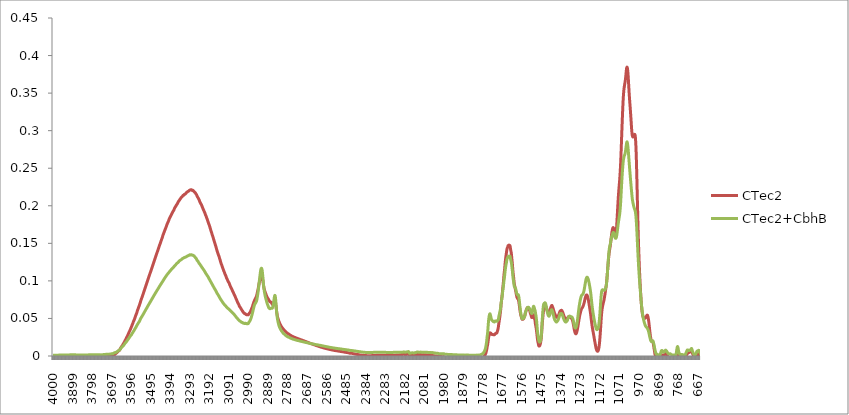
| Category | CTec2 | CTec2+CbhB |
|---|---|---|
| 4000.0 | -0.002 | 0.001 |
| 3999.0 | -0.002 | 0.001 |
| 3998.0 | -0.002 | 0.001 |
| 3997.0 | -0.002 | 0.001 |
| 3996.0 | -0.002 | 0.001 |
| 3995.0 | -0.002 | 0.001 |
| 3994.0 | -0.002 | 0.001 |
| 3993.0 | -0.002 | 0.001 |
| 3992.0 | -0.002 | 0.001 |
| 3991.0 | -0.002 | 0.001 |
| 3990.0 | -0.002 | 0.001 |
| 3989.0 | -0.002 | 0.001 |
| 3988.0 | -0.002 | 0.001 |
| 3987.0 | -0.002 | 0.001 |
| 3986.0 | -0.002 | 0.001 |
| 3985.0 | -0.002 | 0.001 |
| 3984.0 | -0.002 | 0.001 |
| 3983.0 | -0.002 | 0.001 |
| 3982.0 | -0.002 | 0.001 |
| 3981.0 | -0.002 | 0.001 |
| 3980.0 | -0.002 | 0.001 |
| 3979.0 | -0.002 | 0.001 |
| 3978.0 | -0.002 | 0.001 |
| 3977.0 | -0.002 | 0.001 |
| 3976.0 | -0.002 | 0.001 |
| 3975.0 | -0.002 | 0.001 |
| 3974.0 | -0.002 | 0.001 |
| 3973.0 | -0.002 | 0.001 |
| 3972.0 | -0.002 | 0.001 |
| 3971.0 | -0.002 | 0.001 |
| 3970.0 | -0.002 | 0.001 |
| 3969.0 | -0.002 | 0.001 |
| 3968.0 | -0.002 | 0.001 |
| 3967.0 | -0.002 | 0.001 |
| 3966.0 | -0.002 | 0.001 |
| 3965.0 | -0.002 | 0.001 |
| 3964.0 | -0.002 | 0.001 |
| 3963.0 | -0.002 | 0.001 |
| 3962.0 | -0.002 | 0.001 |
| 3961.0 | -0.002 | 0.001 |
| 3960.0 | -0.002 | 0.001 |
| 3959.0 | -0.002 | 0.001 |
| 3958.0 | -0.002 | 0.001 |
| 3957.0 | -0.002 | 0.001 |
| 3956.0 | -0.002 | 0.001 |
| 3955.0 | -0.002 | 0.001 |
| 3954.0 | -0.002 | 0.001 |
| 3953.0 | -0.002 | 0.001 |
| 3952.0 | -0.002 | 0.001 |
| 3951.0 | -0.002 | 0.001 |
| 3950.0 | -0.002 | 0.001 |
| 3949.0 | -0.002 | 0.001 |
| 3948.0 | -0.002 | 0.001 |
| 3947.0 | -0.002 | 0.001 |
| 3946.0 | -0.002 | 0.001 |
| 3945.0 | -0.002 | 0.001 |
| 3944.0 | -0.002 | 0.001 |
| 3943.0 | -0.002 | 0.001 |
| 3942.0 | -0.002 | 0.001 |
| 3941.0 | -0.002 | 0.001 |
| 3940.0 | -0.002 | 0.001 |
| 3939.0 | -0.002 | 0.001 |
| 3938.0 | -0.002 | 0.001 |
| 3937.0 | -0.002 | 0.001 |
| 3936.0 | -0.002 | 0.001 |
| 3935.0 | -0.002 | 0.001 |
| 3934.0 | -0.002 | 0.001 |
| 3933.0 | -0.002 | 0.001 |
| 3932.0 | -0.002 | 0.001 |
| 3931.0 | -0.002 | 0.001 |
| 3930.0 | -0.002 | 0.001 |
| 3929.0 | -0.002 | 0.001 |
| 3928.0 | -0.002 | 0.001 |
| 3927.0 | -0.002 | 0.001 |
| 3926.0 | -0.002 | 0.001 |
| 3925.0 | -0.002 | 0.001 |
| 3924.0 | -0.002 | 0.001 |
| 3923.0 | -0.002 | 0.001 |
| 3922.0 | -0.002 | 0.001 |
| 3921.0 | -0.002 | 0.001 |
| 3920.0 | -0.002 | 0.001 |
| 3919.0 | -0.002 | 0.001 |
| 3918.0 | -0.002 | 0.001 |
| 3917.0 | -0.002 | 0.001 |
| 3916.0 | -0.002 | 0.001 |
| 3915.0 | -0.002 | 0.002 |
| 3914.0 | -0.002 | 0.002 |
| 3913.0 | -0.002 | 0.002 |
| 3912.0 | -0.002 | 0.002 |
| 3911.0 | -0.002 | 0.002 |
| 3910.0 | -0.002 | 0.002 |
| 3909.0 | -0.002 | 0.002 |
| 3908.0 | -0.002 | 0.002 |
| 3907.0 | -0.002 | 0.002 |
| 3906.0 | -0.002 | 0.002 |
| 3905.0 | -0.002 | 0.002 |
| 3904.0 | -0.002 | 0.002 |
| 3903.0 | -0.002 | 0.002 |
| 3902.0 | -0.002 | 0.002 |
| 3901.0 | -0.002 | 0.002 |
| 3900.0 | -0.002 | 0.002 |
| 3899.0 | -0.002 | 0.002 |
| 3898.0 | -0.002 | 0.002 |
| 3897.0 | -0.002 | 0.002 |
| 3896.0 | -0.002 | 0.002 |
| 3895.0 | -0.002 | 0.002 |
| 3894.0 | -0.002 | 0.002 |
| 3893.0 | -0.002 | 0.002 |
| 3892.0 | -0.002 | 0.002 |
| 3891.0 | -0.002 | 0.002 |
| 3890.0 | -0.002 | 0.002 |
| 3889.0 | -0.002 | 0.002 |
| 3888.0 | -0.002 | 0.002 |
| 3887.0 | -0.002 | 0.002 |
| 3886.0 | -0.002 | 0.002 |
| 3885.0 | -0.002 | 0.002 |
| 3884.0 | -0.002 | 0.002 |
| 3883.0 | -0.002 | 0.002 |
| 3882.0 | -0.002 | 0.001 |
| 3881.0 | -0.002 | 0.001 |
| 3880.0 | -0.002 | 0.001 |
| 3879.0 | -0.002 | 0.001 |
| 3878.0 | -0.002 | 0.001 |
| 3877.0 | -0.002 | 0.001 |
| 3876.0 | -0.002 | 0.001 |
| 3875.0 | -0.002 | 0.001 |
| 3874.0 | -0.002 | 0.001 |
| 3873.0 | -0.002 | 0.001 |
| 3872.0 | -0.002 | 0.001 |
| 3871.0 | -0.002 | 0.001 |
| 3870.0 | -0.002 | 0.001 |
| 3869.0 | -0.002 | 0.001 |
| 3868.0 | -0.002 | 0.001 |
| 3867.0 | -0.002 | 0.001 |
| 3866.0 | -0.002 | 0.001 |
| 3865.0 | -0.002 | 0.001 |
| 3864.0 | -0.002 | 0.001 |
| 3863.0 | -0.002 | 0.001 |
| 3862.0 | -0.002 | 0.001 |
| 3861.0 | -0.002 | 0.001 |
| 3860.0 | -0.002 | 0.001 |
| 3859.0 | -0.002 | 0.001 |
| 3858.0 | -0.002 | 0.001 |
| 3857.0 | -0.002 | 0.001 |
| 3856.0 | -0.002 | 0.001 |
| 3855.0 | -0.002 | 0.001 |
| 3854.0 | -0.002 | 0.001 |
| 3853.0 | -0.002 | 0.001 |
| 3852.0 | -0.002 | 0.001 |
| 3851.0 | -0.002 | 0.001 |
| 3850.0 | -0.002 | 0.001 |
| 3849.0 | -0.002 | 0.001 |
| 3848.0 | -0.002 | 0.001 |
| 3847.0 | -0.002 | 0.001 |
| 3846.0 | -0.002 | 0.001 |
| 3845.0 | -0.002 | 0.001 |
| 3844.0 | -0.002 | 0.001 |
| 3843.0 | -0.002 | 0.001 |
| 3842.0 | -0.002 | 0.001 |
| 3841.0 | -0.002 | 0.001 |
| 3840.0 | -0.002 | 0.001 |
| 3839.0 | -0.002 | 0.001 |
| 3838.0 | -0.002 | 0.001 |
| 3837.0 | -0.002 | 0.001 |
| 3836.0 | -0.002 | 0.001 |
| 3835.0 | -0.002 | 0.001 |
| 3834.0 | -0.002 | 0.001 |
| 3833.0 | -0.002 | 0.001 |
| 3832.0 | -0.002 | 0.001 |
| 3831.0 | -0.002 | 0.001 |
| 3830.0 | -0.002 | 0.001 |
| 3829.0 | -0.002 | 0.001 |
| 3828.0 | -0.002 | 0.001 |
| 3827.0 | -0.002 | 0.001 |
| 3826.0 | -0.002 | 0.001 |
| 3825.0 | -0.002 | 0.001 |
| 3824.0 | -0.002 | 0.001 |
| 3823.0 | -0.002 | 0.001 |
| 3822.0 | -0.002 | 0.001 |
| 3821.0 | -0.002 | 0.001 |
| 3820.0 | -0.002 | 0.001 |
| 3819.0 | -0.002 | 0.001 |
| 3818.0 | -0.002 | 0.001 |
| 3817.0 | -0.002 | 0.002 |
| 3816.0 | -0.002 | 0.002 |
| 3815.0 | -0.002 | 0.002 |
| 3814.0 | -0.002 | 0.002 |
| 3813.0 | -0.002 | 0.002 |
| 3812.0 | -0.002 | 0.002 |
| 3811.0 | -0.002 | 0.002 |
| 3810.0 | -0.002 | 0.002 |
| 3809.0 | -0.002 | 0.002 |
| 3808.0 | -0.002 | 0.002 |
| 3807.0 | -0.002 | 0.002 |
| 3806.0 | -0.002 | 0.002 |
| 3805.0 | -0.002 | 0.002 |
| 3804.0 | -0.002 | 0.002 |
| 3803.0 | -0.002 | 0.002 |
| 3802.0 | -0.002 | 0.002 |
| 3801.0 | -0.002 | 0.002 |
| 3800.0 | -0.002 | 0.002 |
| 3799.0 | -0.002 | 0.002 |
| 3798.0 | -0.002 | 0.002 |
| 3797.0 | -0.002 | 0.002 |
| 3796.0 | -0.002 | 0.002 |
| 3795.0 | -0.002 | 0.002 |
| 3794.0 | -0.002 | 0.002 |
| 3793.0 | -0.002 | 0.002 |
| 3792.0 | -0.002 | 0.002 |
| 3791.0 | -0.002 | 0.002 |
| 3790.0 | -0.002 | 0.002 |
| 3789.0 | -0.002 | 0.002 |
| 3788.0 | -0.002 | 0.002 |
| 3787.0 | -0.002 | 0.002 |
| 3786.0 | -0.002 | 0.002 |
| 3785.0 | -0.002 | 0.002 |
| 3784.0 | -0.002 | 0.002 |
| 3783.0 | -0.002 | 0.002 |
| 3782.0 | -0.002 | 0.002 |
| 3781.0 | -0.002 | 0.002 |
| 3780.0 | -0.002 | 0.002 |
| 3779.0 | -0.002 | 0.002 |
| 3778.0 | -0.002 | 0.002 |
| 3777.0 | -0.002 | 0.002 |
| 3776.0 | -0.002 | 0.002 |
| 3775.0 | -0.002 | 0.002 |
| 3774.0 | -0.002 | 0.002 |
| 3773.0 | -0.002 | 0.002 |
| 3772.0 | -0.002 | 0.002 |
| 3771.0 | -0.002 | 0.002 |
| 3770.0 | -0.002 | 0.002 |
| 3769.0 | -0.002 | 0.002 |
| 3768.0 | -0.002 | 0.002 |
| 3767.0 | -0.002 | 0.002 |
| 3766.0 | -0.002 | 0.002 |
| 3765.0 | -0.002 | 0.002 |
| 3764.0 | -0.002 | 0.002 |
| 3763.0 | -0.002 | 0.002 |
| 3762.0 | -0.002 | 0.002 |
| 3761.0 | -0.002 | 0.002 |
| 3760.0 | -0.002 | 0.002 |
| 3759.0 | -0.002 | 0.002 |
| 3758.0 | -0.002 | 0.002 |
| 3757.0 | -0.002 | 0.002 |
| 3756.0 | -0.002 | 0.002 |
| 3755.0 | -0.002 | 0.002 |
| 3754.0 | -0.002 | 0.002 |
| 3753.0 | -0.002 | 0.001 |
| 3752.0 | -0.002 | 0.001 |
| 3751.0 | -0.002 | 0.001 |
| 3750.0 | -0.002 | 0.001 |
| 3749.0 | -0.002 | 0.002 |
| 3748.0 | -0.002 | 0.002 |
| 3747.0 | -0.002 | 0.002 |
| 3746.0 | -0.002 | 0.002 |
| 3745.0 | -0.002 | 0.002 |
| 3744.0 | -0.001 | 0.002 |
| 3743.0 | -0.001 | 0.002 |
| 3742.0 | -0.001 | 0.002 |
| 3741.0 | -0.001 | 0.002 |
| 3740.0 | -0.001 | 0.002 |
| 3739.0 | -0.001 | 0.002 |
| 3738.0 | -0.001 | 0.002 |
| 3737.0 | -0.001 | 0.002 |
| 3736.0 | -0.001 | 0.002 |
| 3735.0 | -0.001 | 0.002 |
| 3734.0 | -0.001 | 0.002 |
| 3733.0 | -0.001 | 0.002 |
| 3732.0 | -0.001 | 0.002 |
| 3731.0 | -0.001 | 0.002 |
| 3730.0 | -0.001 | 0.002 |
| 3729.0 | -0.001 | 0.002 |
| 3728.0 | -0.001 | 0.002 |
| 3727.0 | -0.001 | 0.002 |
| 3726.0 | -0.001 | 0.002 |
| 3725.0 | -0.001 | 0.002 |
| 3724.0 | -0.001 | 0.002 |
| 3723.0 | -0.001 | 0.002 |
| 3722.0 | -0.001 | 0.002 |
| 3721.0 | -0.001 | 0.002 |
| 3720.0 | -0.001 | 0.002 |
| 3719.0 | -0.001 | 0.002 |
| 3718.0 | -0.001 | 0.002 |
| 3717.0 | -0.001 | 0.002 |
| 3716.0 | -0.001 | 0.002 |
| 3715.0 | -0.001 | 0.002 |
| 3714.0 | -0.001 | 0.002 |
| 3713.0 | -0.001 | 0.002 |
| 3712.0 | -0.001 | 0.002 |
| 3711.0 | -0.001 | 0.002 |
| 3710.0 | -0.001 | 0.002 |
| 3709.0 | -0.001 | 0.002 |
| 3708.0 | -0.001 | 0.002 |
| 3707.0 | 0 | 0.003 |
| 3706.0 | 0 | 0.003 |
| 3705.0 | 0 | 0.003 |
| 3704.0 | 0 | 0.003 |
| 3703.0 | 0 | 0.003 |
| 3702.0 | 0 | 0.003 |
| 3701.0 | 0 | 0.003 |
| 3700.0 | 0 | 0.003 |
| 3699.0 | 0 | 0.003 |
| 3698.0 | 0 | 0.003 |
| 3697.0 | 0 | 0.003 |
| 3696.0 | 0 | 0.003 |
| 3695.0 | 0 | 0.003 |
| 3694.0 | 0 | 0.003 |
| 3693.0 | 0.001 | 0.003 |
| 3692.0 | 0.001 | 0.003 |
| 3691.0 | 0.001 | 0.003 |
| 3690.0 | 0.001 | 0.003 |
| 3689.0 | 0.001 | 0.003 |
| 3688.0 | 0.001 | 0.003 |
| 3687.0 | 0.001 | 0.004 |
| 3686.0 | 0.002 | 0.004 |
| 3685.0 | 0.002 | 0.004 |
| 3684.0 | 0.002 | 0.004 |
| 3683.0 | 0.002 | 0.004 |
| 3682.0 | 0.002 | 0.004 |
| 3681.0 | 0.002 | 0.004 |
| 3680.0 | 0.002 | 0.004 |
| 3679.0 | 0.003 | 0.005 |
| 3678.0 | 0.003 | 0.005 |
| 3677.0 | 0.003 | 0.005 |
| 3676.0 | 0.003 | 0.005 |
| 3675.0 | 0.004 | 0.005 |
| 3674.0 | 0.004 | 0.005 |
| 3673.0 | 0.004 | 0.005 |
| 3672.0 | 0.004 | 0.005 |
| 3671.0 | 0.004 | 0.005 |
| 3670.0 | 0.004 | 0.005 |
| 3669.0 | 0.005 | 0.006 |
| 3668.0 | 0.005 | 0.006 |
| 3667.0 | 0.005 | 0.006 |
| 3666.0 | 0.005 | 0.006 |
| 3665.0 | 0.006 | 0.007 |
| 3664.0 | 0.006 | 0.007 |
| 3663.0 | 0.006 | 0.007 |
| 3662.0 | 0.007 | 0.007 |
| 3661.0 | 0.007 | 0.007 |
| 3660.0 | 0.007 | 0.007 |
| 3659.0 | 0.007 | 0.008 |
| 3658.0 | 0.007 | 0.008 |
| 3657.0 | 0.008 | 0.008 |
| 3656.0 | 0.008 | 0.008 |
| 3655.0 | 0.008 | 0.008 |
| 3654.0 | 0.009 | 0.009 |
| 3653.0 | 0.009 | 0.009 |
| 3652.0 | 0.01 | 0.009 |
| 3651.0 | 0.01 | 0.01 |
| 3650.0 | 0.011 | 0.01 |
| 3649.0 | 0.011 | 0.01 |
| 3648.0 | 0.012 | 0.011 |
| 3647.0 | 0.012 | 0.011 |
| 3646.0 | 0.013 | 0.011 |
| 3645.0 | 0.013 | 0.012 |
| 3644.0 | 0.013 | 0.012 |
| 3643.0 | 0.014 | 0.012 |
| 3642.0 | 0.014 | 0.012 |
| 3641.0 | 0.014 | 0.013 |
| 3640.0 | 0.015 | 0.013 |
| 3639.0 | 0.015 | 0.013 |
| 3638.0 | 0.016 | 0.013 |
| 3637.0 | 0.016 | 0.014 |
| 3636.0 | 0.017 | 0.014 |
| 3635.0 | 0.017 | 0.014 |
| 3634.0 | 0.018 | 0.015 |
| 3633.0 | 0.018 | 0.015 |
| 3632.0 | 0.018 | 0.015 |
| 3631.0 | 0.019 | 0.016 |
| 3630.0 | 0.019 | 0.016 |
| 3629.0 | 0.02 | 0.017 |
| 3628.0 | 0.02 | 0.017 |
| 3627.0 | 0.021 | 0.017 |
| 3626.0 | 0.021 | 0.018 |
| 3625.0 | 0.022 | 0.018 |
| 3624.0 | 0.022 | 0.018 |
| 3623.0 | 0.023 | 0.018 |
| 3622.0 | 0.023 | 0.019 |
| 3621.0 | 0.024 | 0.019 |
| 3620.0 | 0.025 | 0.019 |
| 3619.0 | 0.025 | 0.02 |
| 3618.0 | 0.025 | 0.02 |
| 3617.0 | 0.026 | 0.02 |
| 3616.0 | 0.026 | 0.021 |
| 3615.0 | 0.027 | 0.021 |
| 3614.0 | 0.028 | 0.022 |
| 3613.0 | 0.028 | 0.022 |
| 3612.0 | 0.029 | 0.022 |
| 3611.0 | 0.029 | 0.023 |
| 3610.0 | 0.03 | 0.023 |
| 3609.0 | 0.031 | 0.023 |
| 3608.0 | 0.031 | 0.024 |
| 3607.0 | 0.032 | 0.024 |
| 3606.0 | 0.032 | 0.025 |
| 3605.0 | 0.033 | 0.025 |
| 3604.0 | 0.033 | 0.025 |
| 3603.0 | 0.034 | 0.026 |
| 3602.0 | 0.034 | 0.026 |
| 3601.0 | 0.035 | 0.026 |
| 3600.0 | 0.036 | 0.027 |
| 3599.0 | 0.036 | 0.027 |
| 3598.0 | 0.037 | 0.027 |
| 3597.0 | 0.038 | 0.028 |
| 3596.0 | 0.038 | 0.028 |
| 3595.0 | 0.039 | 0.028 |
| 3594.0 | 0.039 | 0.029 |
| 3593.0 | 0.04 | 0.029 |
| 3592.0 | 0.041 | 0.03 |
| 3591.0 | 0.041 | 0.03 |
| 3590.0 | 0.042 | 0.031 |
| 3589.0 | 0.043 | 0.031 |
| 3588.0 | 0.043 | 0.031 |
| 3587.0 | 0.044 | 0.032 |
| 3586.0 | 0.045 | 0.032 |
| 3585.0 | 0.046 | 0.033 |
| 3584.0 | 0.046 | 0.033 |
| 3583.0 | 0.047 | 0.033 |
| 3582.0 | 0.047 | 0.034 |
| 3581.0 | 0.048 | 0.034 |
| 3580.0 | 0.049 | 0.035 |
| 3579.0 | 0.049 | 0.035 |
| 3578.0 | 0.05 | 0.036 |
| 3577.0 | 0.051 | 0.036 |
| 3576.0 | 0.051 | 0.036 |
| 3575.0 | 0.052 | 0.037 |
| 3574.0 | 0.053 | 0.037 |
| 3573.0 | 0.054 | 0.038 |
| 3572.0 | 0.054 | 0.038 |
| 3571.0 | 0.055 | 0.039 |
| 3570.0 | 0.056 | 0.039 |
| 3569.0 | 0.056 | 0.04 |
| 3568.0 | 0.057 | 0.04 |
| 3567.0 | 0.058 | 0.041 |
| 3566.0 | 0.059 | 0.041 |
| 3565.0 | 0.059 | 0.041 |
| 3564.0 | 0.06 | 0.042 |
| 3563.0 | 0.061 | 0.042 |
| 3562.0 | 0.062 | 0.043 |
| 3561.0 | 0.062 | 0.043 |
| 3560.0 | 0.063 | 0.044 |
| 3559.0 | 0.064 | 0.044 |
| 3558.0 | 0.065 | 0.044 |
| 3557.0 | 0.065 | 0.045 |
| 3556.0 | 0.066 | 0.045 |
| 3555.0 | 0.067 | 0.046 |
| 3554.0 | 0.067 | 0.046 |
| 3553.0 | 0.068 | 0.046 |
| 3552.0 | 0.069 | 0.047 |
| 3551.0 | 0.07 | 0.048 |
| 3550.0 | 0.07 | 0.048 |
| 3549.0 | 0.071 | 0.049 |
| 3548.0 | 0.072 | 0.049 |
| 3547.0 | 0.073 | 0.05 |
| 3546.0 | 0.074 | 0.05 |
| 3545.0 | 0.075 | 0.051 |
| 3544.0 | 0.075 | 0.051 |
| 3543.0 | 0.076 | 0.052 |
| 3542.0 | 0.077 | 0.052 |
| 3541.0 | 0.078 | 0.052 |
| 3540.0 | 0.078 | 0.053 |
| 3539.0 | 0.079 | 0.053 |
| 3538.0 | 0.08 | 0.054 |
| 3537.0 | 0.081 | 0.054 |
| 3536.0 | 0.081 | 0.055 |
| 3535.0 | 0.082 | 0.055 |
| 3534.0 | 0.083 | 0.055 |
| 3533.0 | 0.083 | 0.056 |
| 3532.0 | 0.084 | 0.056 |
| 3531.0 | 0.085 | 0.057 |
| 3530.0 | 0.086 | 0.057 |
| 3529.0 | 0.087 | 0.058 |
| 3528.0 | 0.087 | 0.058 |
| 3527.0 | 0.088 | 0.059 |
| 3526.0 | 0.089 | 0.059 |
| 3525.0 | 0.09 | 0.06 |
| 3524.0 | 0.091 | 0.06 |
| 3523.0 | 0.091 | 0.061 |
| 3522.0 | 0.092 | 0.061 |
| 3521.0 | 0.093 | 0.061 |
| 3520.0 | 0.094 | 0.062 |
| 3519.0 | 0.094 | 0.062 |
| 3518.0 | 0.095 | 0.063 |
| 3517.0 | 0.096 | 0.063 |
| 3516.0 | 0.097 | 0.064 |
| 3515.0 | 0.097 | 0.064 |
| 3514.0 | 0.098 | 0.065 |
| 3513.0 | 0.099 | 0.065 |
| 3512.0 | 0.1 | 0.066 |
| 3511.0 | 0.101 | 0.066 |
| 3510.0 | 0.101 | 0.067 |
| 3509.0 | 0.102 | 0.067 |
| 3508.0 | 0.103 | 0.067 |
| 3507.0 | 0.104 | 0.068 |
| 3506.0 | 0.104 | 0.068 |
| 3505.0 | 0.105 | 0.069 |
| 3504.0 | 0.106 | 0.069 |
| 3503.0 | 0.107 | 0.07 |
| 3502.0 | 0.107 | 0.07 |
| 3501.0 | 0.108 | 0.07 |
| 3500.0 | 0.109 | 0.071 |
| 3499.0 | 0.11 | 0.071 |
| 3498.0 | 0.111 | 0.072 |
| 3497.0 | 0.111 | 0.072 |
| 3496.0 | 0.112 | 0.073 |
| 3495.0 | 0.113 | 0.073 |
| 3494.0 | 0.113 | 0.074 |
| 3493.0 | 0.114 | 0.074 |
| 3492.0 | 0.115 | 0.074 |
| 3491.0 | 0.116 | 0.075 |
| 3490.0 | 0.117 | 0.075 |
| 3489.0 | 0.117 | 0.076 |
| 3488.0 | 0.118 | 0.076 |
| 3487.0 | 0.119 | 0.077 |
| 3486.0 | 0.12 | 0.077 |
| 3485.0 | 0.12 | 0.078 |
| 3484.0 | 0.121 | 0.078 |
| 3483.0 | 0.122 | 0.078 |
| 3482.0 | 0.123 | 0.079 |
| 3481.0 | 0.124 | 0.079 |
| 3480.0 | 0.124 | 0.08 |
| 3479.0 | 0.125 | 0.08 |
| 3478.0 | 0.126 | 0.081 |
| 3477.0 | 0.127 | 0.081 |
| 3476.0 | 0.127 | 0.082 |
| 3475.0 | 0.128 | 0.082 |
| 3474.0 | 0.129 | 0.082 |
| 3473.0 | 0.13 | 0.083 |
| 3472.0 | 0.13 | 0.083 |
| 3471.0 | 0.131 | 0.084 |
| 3470.0 | 0.132 | 0.084 |
| 3469.0 | 0.133 | 0.084 |
| 3468.0 | 0.133 | 0.085 |
| 3467.0 | 0.134 | 0.085 |
| 3466.0 | 0.135 | 0.086 |
| 3465.0 | 0.136 | 0.086 |
| 3464.0 | 0.136 | 0.087 |
| 3463.0 | 0.137 | 0.087 |
| 3462.0 | 0.138 | 0.088 |
| 3461.0 | 0.139 | 0.088 |
| 3460.0 | 0.14 | 0.088 |
| 3459.0 | 0.14 | 0.089 |
| 3458.0 | 0.141 | 0.089 |
| 3457.0 | 0.142 | 0.09 |
| 3456.0 | 0.143 | 0.09 |
| 3455.0 | 0.143 | 0.09 |
| 3454.0 | 0.144 | 0.091 |
| 3453.0 | 0.145 | 0.091 |
| 3452.0 | 0.145 | 0.092 |
| 3451.0 | 0.146 | 0.092 |
| 3450.0 | 0.147 | 0.093 |
| 3449.0 | 0.148 | 0.093 |
| 3448.0 | 0.148 | 0.093 |
| 3447.0 | 0.149 | 0.094 |
| 3446.0 | 0.15 | 0.094 |
| 3445.0 | 0.151 | 0.095 |
| 3444.0 | 0.151 | 0.095 |
| 3443.0 | 0.152 | 0.095 |
| 3442.0 | 0.153 | 0.096 |
| 3441.0 | 0.154 | 0.096 |
| 3440.0 | 0.154 | 0.097 |
| 3439.0 | 0.155 | 0.097 |
| 3438.0 | 0.156 | 0.098 |
| 3437.0 | 0.157 | 0.098 |
| 3436.0 | 0.157 | 0.098 |
| 3435.0 | 0.158 | 0.099 |
| 3434.0 | 0.159 | 0.099 |
| 3433.0 | 0.16 | 0.099 |
| 3432.0 | 0.161 | 0.1 |
| 3431.0 | 0.161 | 0.1 |
| 3430.0 | 0.162 | 0.101 |
| 3429.0 | 0.163 | 0.101 |
| 3428.0 | 0.163 | 0.102 |
| 3427.0 | 0.164 | 0.102 |
| 3426.0 | 0.165 | 0.102 |
| 3425.0 | 0.165 | 0.103 |
| 3424.0 | 0.166 | 0.103 |
| 3423.0 | 0.167 | 0.104 |
| 3422.0 | 0.168 | 0.104 |
| 3421.0 | 0.168 | 0.104 |
| 3420.0 | 0.169 | 0.105 |
| 3419.0 | 0.17 | 0.105 |
| 3418.0 | 0.17 | 0.106 |
| 3417.0 | 0.171 | 0.106 |
| 3416.0 | 0.172 | 0.106 |
| 3415.0 | 0.172 | 0.107 |
| 3414.0 | 0.173 | 0.107 |
| 3413.0 | 0.174 | 0.107 |
| 3412.0 | 0.174 | 0.108 |
| 3411.0 | 0.175 | 0.108 |
| 3410.0 | 0.176 | 0.108 |
| 3409.0 | 0.176 | 0.109 |
| 3408.0 | 0.177 | 0.109 |
| 3407.0 | 0.178 | 0.109 |
| 3406.0 | 0.178 | 0.11 |
| 3405.0 | 0.179 | 0.11 |
| 3404.0 | 0.179 | 0.11 |
| 3403.0 | 0.18 | 0.111 |
| 3402.0 | 0.181 | 0.111 |
| 3401.0 | 0.181 | 0.111 |
| 3400.0 | 0.182 | 0.112 |
| 3399.0 | 0.183 | 0.112 |
| 3398.0 | 0.183 | 0.112 |
| 3397.0 | 0.184 | 0.113 |
| 3396.0 | 0.184 | 0.113 |
| 3395.0 | 0.185 | 0.113 |
| 3394.0 | 0.185 | 0.114 |
| 3393.0 | 0.186 | 0.114 |
| 3392.0 | 0.186 | 0.114 |
| 3391.0 | 0.187 | 0.114 |
| 3390.0 | 0.187 | 0.115 |
| 3389.0 | 0.188 | 0.115 |
| 3388.0 | 0.188 | 0.115 |
| 3387.0 | 0.189 | 0.116 |
| 3386.0 | 0.19 | 0.116 |
| 3385.0 | 0.19 | 0.116 |
| 3384.0 | 0.19 | 0.116 |
| 3383.0 | 0.191 | 0.117 |
| 3382.0 | 0.192 | 0.117 |
| 3381.0 | 0.192 | 0.117 |
| 3380.0 | 0.192 | 0.117 |
| 3379.0 | 0.193 | 0.118 |
| 3378.0 | 0.193 | 0.118 |
| 3377.0 | 0.194 | 0.118 |
| 3376.0 | 0.194 | 0.119 |
| 3375.0 | 0.195 | 0.119 |
| 3374.0 | 0.195 | 0.119 |
| 3373.0 | 0.196 | 0.12 |
| 3372.0 | 0.197 | 0.12 |
| 3371.0 | 0.197 | 0.12 |
| 3370.0 | 0.198 | 0.12 |
| 3369.0 | 0.198 | 0.121 |
| 3368.0 | 0.198 | 0.121 |
| 3367.0 | 0.199 | 0.121 |
| 3366.0 | 0.199 | 0.122 |
| 3365.0 | 0.2 | 0.122 |
| 3364.0 | 0.2 | 0.122 |
| 3363.0 | 0.2 | 0.122 |
| 3362.0 | 0.201 | 0.123 |
| 3361.0 | 0.201 | 0.123 |
| 3360.0 | 0.202 | 0.123 |
| 3359.0 | 0.202 | 0.124 |
| 3358.0 | 0.203 | 0.124 |
| 3357.0 | 0.203 | 0.124 |
| 3356.0 | 0.204 | 0.124 |
| 3355.0 | 0.204 | 0.124 |
| 3354.0 | 0.205 | 0.124 |
| 3353.0 | 0.205 | 0.125 |
| 3352.0 | 0.206 | 0.125 |
| 3351.0 | 0.206 | 0.125 |
| 3350.0 | 0.206 | 0.126 |
| 3349.0 | 0.207 | 0.126 |
| 3348.0 | 0.207 | 0.126 |
| 3347.0 | 0.207 | 0.127 |
| 3346.0 | 0.208 | 0.127 |
| 3345.0 | 0.208 | 0.127 |
| 3344.0 | 0.209 | 0.127 |
| 3343.0 | 0.209 | 0.127 |
| 3342.0 | 0.209 | 0.128 |
| 3341.0 | 0.21 | 0.128 |
| 3340.0 | 0.21 | 0.128 |
| 3339.0 | 0.21 | 0.128 |
| 3338.0 | 0.211 | 0.128 |
| 3337.0 | 0.211 | 0.128 |
| 3336.0 | 0.211 | 0.129 |
| 3335.0 | 0.212 | 0.129 |
| 3334.0 | 0.212 | 0.129 |
| 3333.0 | 0.212 | 0.129 |
| 3332.0 | 0.212 | 0.129 |
| 3331.0 | 0.213 | 0.13 |
| 3330.0 | 0.213 | 0.13 |
| 3329.0 | 0.213 | 0.13 |
| 3328.0 | 0.214 | 0.13 |
| 3327.0 | 0.214 | 0.13 |
| 3326.0 | 0.214 | 0.13 |
| 3325.0 | 0.214 | 0.131 |
| 3324.0 | 0.214 | 0.131 |
| 3323.0 | 0.214 | 0.131 |
| 3322.0 | 0.215 | 0.131 |
| 3321.0 | 0.215 | 0.131 |
| 3320.0 | 0.215 | 0.131 |
| 3319.0 | 0.215 | 0.131 |
| 3318.0 | 0.215 | 0.131 |
| 3317.0 | 0.216 | 0.131 |
| 3316.0 | 0.216 | 0.131 |
| 3315.0 | 0.216 | 0.132 |
| 3314.0 | 0.216 | 0.132 |
| 3313.0 | 0.217 | 0.132 |
| 3312.0 | 0.217 | 0.132 |
| 3311.0 | 0.217 | 0.132 |
| 3310.0 | 0.218 | 0.132 |
| 3309.0 | 0.218 | 0.132 |
| 3308.0 | 0.218 | 0.133 |
| 3307.0 | 0.218 | 0.133 |
| 3306.0 | 0.218 | 0.133 |
| 3305.0 | 0.219 | 0.133 |
| 3304.0 | 0.219 | 0.133 |
| 3303.0 | 0.219 | 0.133 |
| 3302.0 | 0.219 | 0.134 |
| 3301.0 | 0.219 | 0.134 |
| 3300.0 | 0.219 | 0.134 |
| 3299.0 | 0.219 | 0.134 |
| 3298.0 | 0.22 | 0.134 |
| 3297.0 | 0.22 | 0.134 |
| 3296.0 | 0.22 | 0.134 |
| 3295.0 | 0.22 | 0.134 |
| 3294.0 | 0.221 | 0.135 |
| 3293.0 | 0.221 | 0.135 |
| 3292.0 | 0.221 | 0.135 |
| 3291.0 | 0.221 | 0.134 |
| 3290.0 | 0.221 | 0.134 |
| 3289.0 | 0.221 | 0.135 |
| 3288.0 | 0.221 | 0.135 |
| 3287.0 | 0.221 | 0.135 |
| 3286.0 | 0.221 | 0.135 |
| 3285.0 | 0.221 | 0.135 |
| 3284.0 | 0.221 | 0.135 |
| 3283.0 | 0.221 | 0.135 |
| 3282.0 | 0.221 | 0.134 |
| 3281.0 | 0.22 | 0.134 |
| 3280.0 | 0.22 | 0.134 |
| 3279.0 | 0.22 | 0.134 |
| 3278.0 | 0.221 | 0.134 |
| 3277.0 | 0.221 | 0.134 |
| 3276.0 | 0.22 | 0.134 |
| 3275.0 | 0.22 | 0.134 |
| 3274.0 | 0.22 | 0.134 |
| 3273.0 | 0.219 | 0.134 |
| 3272.0 | 0.219 | 0.133 |
| 3271.0 | 0.219 | 0.133 |
| 3270.0 | 0.219 | 0.133 |
| 3269.0 | 0.218 | 0.133 |
| 3268.0 | 0.218 | 0.132 |
| 3267.0 | 0.218 | 0.132 |
| 3266.0 | 0.218 | 0.132 |
| 3265.0 | 0.217 | 0.131 |
| 3264.0 | 0.217 | 0.131 |
| 3263.0 | 0.217 | 0.131 |
| 3262.0 | 0.216 | 0.13 |
| 3261.0 | 0.216 | 0.13 |
| 3260.0 | 0.215 | 0.13 |
| 3259.0 | 0.215 | 0.129 |
| 3258.0 | 0.215 | 0.129 |
| 3257.0 | 0.214 | 0.128 |
| 3256.0 | 0.213 | 0.128 |
| 3255.0 | 0.213 | 0.127 |
| 3254.0 | 0.212 | 0.127 |
| 3253.0 | 0.212 | 0.127 |
| 3252.0 | 0.211 | 0.127 |
| 3251.0 | 0.211 | 0.126 |
| 3250.0 | 0.21 | 0.126 |
| 3249.0 | 0.21 | 0.125 |
| 3248.0 | 0.209 | 0.125 |
| 3247.0 | 0.209 | 0.124 |
| 3246.0 | 0.208 | 0.124 |
| 3245.0 | 0.208 | 0.123 |
| 3244.0 | 0.207 | 0.123 |
| 3243.0 | 0.207 | 0.123 |
| 3242.0 | 0.206 | 0.123 |
| 3241.0 | 0.205 | 0.122 |
| 3240.0 | 0.205 | 0.122 |
| 3239.0 | 0.204 | 0.121 |
| 3238.0 | 0.204 | 0.121 |
| 3237.0 | 0.203 | 0.121 |
| 3236.0 | 0.203 | 0.12 |
| 3235.0 | 0.202 | 0.12 |
| 3234.0 | 0.202 | 0.12 |
| 3233.0 | 0.201 | 0.119 |
| 3232.0 | 0.201 | 0.119 |
| 3231.0 | 0.2 | 0.118 |
| 3230.0 | 0.199 | 0.118 |
| 3229.0 | 0.199 | 0.118 |
| 3228.0 | 0.198 | 0.117 |
| 3227.0 | 0.198 | 0.117 |
| 3226.0 | 0.197 | 0.116 |
| 3225.0 | 0.196 | 0.116 |
| 3224.0 | 0.196 | 0.116 |
| 3223.0 | 0.195 | 0.115 |
| 3222.0 | 0.194 | 0.115 |
| 3221.0 | 0.194 | 0.115 |
| 3220.0 | 0.193 | 0.114 |
| 3219.0 | 0.193 | 0.114 |
| 3218.0 | 0.192 | 0.113 |
| 3217.0 | 0.192 | 0.113 |
| 3216.0 | 0.191 | 0.113 |
| 3215.0 | 0.19 | 0.112 |
| 3214.0 | 0.19 | 0.112 |
| 3213.0 | 0.189 | 0.111 |
| 3212.0 | 0.188 | 0.111 |
| 3211.0 | 0.187 | 0.11 |
| 3210.0 | 0.187 | 0.11 |
| 3209.0 | 0.186 | 0.109 |
| 3208.0 | 0.186 | 0.109 |
| 3207.0 | 0.185 | 0.109 |
| 3206.0 | 0.184 | 0.108 |
| 3205.0 | 0.183 | 0.108 |
| 3204.0 | 0.183 | 0.108 |
| 3203.0 | 0.182 | 0.107 |
| 3202.0 | 0.181 | 0.107 |
| 3201.0 | 0.181 | 0.106 |
| 3200.0 | 0.18 | 0.106 |
| 3199.0 | 0.179 | 0.106 |
| 3198.0 | 0.178 | 0.105 |
| 3197.0 | 0.177 | 0.105 |
| 3196.0 | 0.177 | 0.104 |
| 3195.0 | 0.176 | 0.104 |
| 3194.0 | 0.175 | 0.103 |
| 3193.0 | 0.175 | 0.103 |
| 3192.0 | 0.174 | 0.102 |
| 3191.0 | 0.173 | 0.102 |
| 3190.0 | 0.172 | 0.101 |
| 3189.0 | 0.171 | 0.101 |
| 3188.0 | 0.171 | 0.101 |
| 3187.0 | 0.17 | 0.1 |
| 3186.0 | 0.169 | 0.099 |
| 3185.0 | 0.168 | 0.099 |
| 3184.0 | 0.167 | 0.098 |
| 3183.0 | 0.166 | 0.098 |
| 3182.0 | 0.165 | 0.098 |
| 3181.0 | 0.165 | 0.097 |
| 3180.0 | 0.164 | 0.097 |
| 3179.0 | 0.163 | 0.096 |
| 3178.0 | 0.162 | 0.096 |
| 3177.0 | 0.161 | 0.095 |
| 3176.0 | 0.161 | 0.095 |
| 3175.0 | 0.16 | 0.094 |
| 3174.0 | 0.159 | 0.094 |
| 3173.0 | 0.158 | 0.093 |
| 3172.0 | 0.157 | 0.093 |
| 3171.0 | 0.156 | 0.092 |
| 3170.0 | 0.156 | 0.092 |
| 3169.0 | 0.155 | 0.092 |
| 3168.0 | 0.154 | 0.091 |
| 3167.0 | 0.153 | 0.091 |
| 3166.0 | 0.152 | 0.09 |
| 3165.0 | 0.151 | 0.09 |
| 3164.0 | 0.151 | 0.089 |
| 3163.0 | 0.15 | 0.089 |
| 3162.0 | 0.149 | 0.088 |
| 3161.0 | 0.148 | 0.088 |
| 3160.0 | 0.147 | 0.088 |
| 3159.0 | 0.146 | 0.087 |
| 3158.0 | 0.146 | 0.087 |
| 3157.0 | 0.145 | 0.086 |
| 3156.0 | 0.144 | 0.085 |
| 3155.0 | 0.143 | 0.085 |
| 3154.0 | 0.142 | 0.084 |
| 3153.0 | 0.141 | 0.084 |
| 3152.0 | 0.14 | 0.083 |
| 3151.0 | 0.139 | 0.083 |
| 3150.0 | 0.138 | 0.083 |
| 3149.0 | 0.138 | 0.082 |
| 3148.0 | 0.137 | 0.082 |
| 3147.0 | 0.136 | 0.082 |
| 3146.0 | 0.135 | 0.081 |
| 3145.0 | 0.135 | 0.081 |
| 3144.0 | 0.134 | 0.08 |
| 3143.0 | 0.133 | 0.08 |
| 3142.0 | 0.133 | 0.079 |
| 3141.0 | 0.132 | 0.079 |
| 3140.0 | 0.131 | 0.078 |
| 3139.0 | 0.13 | 0.078 |
| 3138.0 | 0.129 | 0.077 |
| 3137.0 | 0.128 | 0.077 |
| 3136.0 | 0.128 | 0.077 |
| 3135.0 | 0.127 | 0.076 |
| 3134.0 | 0.126 | 0.076 |
| 3133.0 | 0.125 | 0.075 |
| 3132.0 | 0.124 | 0.075 |
| 3131.0 | 0.123 | 0.074 |
| 3130.0 | 0.122 | 0.074 |
| 3129.0 | 0.122 | 0.074 |
| 3128.0 | 0.121 | 0.073 |
| 3127.0 | 0.12 | 0.073 |
| 3126.0 | 0.12 | 0.073 |
| 3125.0 | 0.119 | 0.072 |
| 3124.0 | 0.118 | 0.072 |
| 3123.0 | 0.117 | 0.071 |
| 3122.0 | 0.117 | 0.071 |
| 3121.0 | 0.116 | 0.071 |
| 3120.0 | 0.115 | 0.07 |
| 3119.0 | 0.114 | 0.07 |
| 3118.0 | 0.114 | 0.07 |
| 3117.0 | 0.113 | 0.069 |
| 3116.0 | 0.113 | 0.069 |
| 3115.0 | 0.112 | 0.069 |
| 3114.0 | 0.111 | 0.068 |
| 3113.0 | 0.11 | 0.068 |
| 3112.0 | 0.11 | 0.068 |
| 3111.0 | 0.109 | 0.067 |
| 3110.0 | 0.109 | 0.067 |
| 3109.0 | 0.108 | 0.067 |
| 3108.0 | 0.107 | 0.067 |
| 3107.0 | 0.107 | 0.067 |
| 3106.0 | 0.106 | 0.066 |
| 3105.0 | 0.105 | 0.066 |
| 3104.0 | 0.105 | 0.066 |
| 3103.0 | 0.104 | 0.065 |
| 3102.0 | 0.103 | 0.065 |
| 3101.0 | 0.103 | 0.065 |
| 3100.0 | 0.102 | 0.064 |
| 3099.0 | 0.102 | 0.064 |
| 3098.0 | 0.101 | 0.064 |
| 3097.0 | 0.101 | 0.064 |
| 3096.0 | 0.1 | 0.063 |
| 3095.0 | 0.099 | 0.063 |
| 3094.0 | 0.099 | 0.063 |
| 3093.0 | 0.099 | 0.063 |
| 3092.0 | 0.098 | 0.063 |
| 3091.0 | 0.098 | 0.062 |
| 3090.0 | 0.097 | 0.062 |
| 3089.0 | 0.097 | 0.062 |
| 3088.0 | 0.096 | 0.062 |
| 3087.0 | 0.095 | 0.062 |
| 3086.0 | 0.094 | 0.061 |
| 3085.0 | 0.094 | 0.061 |
| 3084.0 | 0.093 | 0.061 |
| 3083.0 | 0.093 | 0.06 |
| 3082.0 | 0.092 | 0.06 |
| 3081.0 | 0.092 | 0.06 |
| 3080.0 | 0.091 | 0.06 |
| 3079.0 | 0.09 | 0.059 |
| 3078.0 | 0.09 | 0.059 |
| 3077.0 | 0.089 | 0.059 |
| 3076.0 | 0.089 | 0.059 |
| 3075.0 | 0.088 | 0.058 |
| 3074.0 | 0.088 | 0.058 |
| 3073.0 | 0.087 | 0.058 |
| 3072.0 | 0.087 | 0.058 |
| 3071.0 | 0.086 | 0.057 |
| 3070.0 | 0.085 | 0.057 |
| 3069.0 | 0.085 | 0.057 |
| 3068.0 | 0.084 | 0.056 |
| 3067.0 | 0.084 | 0.056 |
| 3066.0 | 0.083 | 0.056 |
| 3065.0 | 0.083 | 0.056 |
| 3064.0 | 0.082 | 0.055 |
| 3063.0 | 0.082 | 0.055 |
| 3062.0 | 0.081 | 0.055 |
| 3061.0 | 0.081 | 0.054 |
| 3060.0 | 0.08 | 0.054 |
| 3059.0 | 0.08 | 0.054 |
| 3058.0 | 0.079 | 0.053 |
| 3057.0 | 0.078 | 0.053 |
| 3056.0 | 0.078 | 0.053 |
| 3055.0 | 0.077 | 0.052 |
| 3054.0 | 0.076 | 0.052 |
| 3053.0 | 0.076 | 0.052 |
| 3052.0 | 0.075 | 0.051 |
| 3051.0 | 0.075 | 0.051 |
| 3050.0 | 0.074 | 0.051 |
| 3049.0 | 0.073 | 0.051 |
| 3048.0 | 0.073 | 0.05 |
| 3047.0 | 0.072 | 0.05 |
| 3046.0 | 0.072 | 0.05 |
| 3045.0 | 0.071 | 0.049 |
| 3044.0 | 0.07 | 0.049 |
| 3043.0 | 0.07 | 0.049 |
| 3042.0 | 0.07 | 0.048 |
| 3041.0 | 0.069 | 0.048 |
| 3040.0 | 0.069 | 0.048 |
| 3039.0 | 0.068 | 0.048 |
| 3038.0 | 0.067 | 0.047 |
| 3037.0 | 0.067 | 0.047 |
| 3036.0 | 0.066 | 0.047 |
| 3035.0 | 0.066 | 0.047 |
| 3034.0 | 0.065 | 0.047 |
| 3033.0 | 0.065 | 0.046 |
| 3032.0 | 0.065 | 0.046 |
| 3031.0 | 0.064 | 0.046 |
| 3030.0 | 0.064 | 0.046 |
| 3029.0 | 0.063 | 0.046 |
| 3028.0 | 0.063 | 0.045 |
| 3027.0 | 0.063 | 0.045 |
| 3026.0 | 0.062 | 0.045 |
| 3025.0 | 0.062 | 0.045 |
| 3024.0 | 0.061 | 0.045 |
| 3023.0 | 0.061 | 0.045 |
| 3022.0 | 0.06 | 0.045 |
| 3021.0 | 0.06 | 0.045 |
| 3020.0 | 0.06 | 0.044 |
| 3019.0 | 0.059 | 0.044 |
| 3018.0 | 0.059 | 0.044 |
| 3017.0 | 0.058 | 0.044 |
| 3016.0 | 0.058 | 0.044 |
| 3015.0 | 0.058 | 0.044 |
| 3014.0 | 0.058 | 0.044 |
| 3013.0 | 0.057 | 0.044 |
| 3012.0 | 0.057 | 0.043 |
| 3011.0 | 0.057 | 0.043 |
| 3010.0 | 0.057 | 0.043 |
| 3009.0 | 0.056 | 0.043 |
| 3008.0 | 0.056 | 0.043 |
| 3007.0 | 0.056 | 0.043 |
| 3006.0 | 0.056 | 0.044 |
| 3005.0 | 0.056 | 0.044 |
| 3004.0 | 0.056 | 0.043 |
| 3003.0 | 0.055 | 0.043 |
| 3002.0 | 0.055 | 0.043 |
| 3001.0 | 0.055 | 0.043 |
| 3000.0 | 0.055 | 0.043 |
| 2999.0 | 0.055 | 0.043 |
| 2998.0 | 0.055 | 0.043 |
| 2997.0 | 0.055 | 0.043 |
| 2996.0 | 0.055 | 0.043 |
| 2995.0 | 0.055 | 0.043 |
| 2994.0 | 0.055 | 0.043 |
| 2993.0 | 0.055 | 0.043 |
| 2992.0 | 0.055 | 0.043 |
| 2991.0 | 0.055 | 0.043 |
| 2990.0 | 0.055 | 0.043 |
| 2989.0 | 0.055 | 0.044 |
| 2988.0 | 0.056 | 0.045 |
| 2987.0 | 0.056 | 0.045 |
| 2986.0 | 0.057 | 0.045 |
| 2985.0 | 0.057 | 0.046 |
| 2984.0 | 0.057 | 0.046 |
| 2983.0 | 0.058 | 0.046 |
| 2982.0 | 0.058 | 0.047 |
| 2981.0 | 0.058 | 0.047 |
| 2980.0 | 0.059 | 0.048 |
| 2979.0 | 0.06 | 0.049 |
| 2978.0 | 0.06 | 0.049 |
| 2977.0 | 0.061 | 0.05 |
| 2976.0 | 0.061 | 0.051 |
| 2975.0 | 0.062 | 0.052 |
| 2974.0 | 0.063 | 0.053 |
| 2973.0 | 0.063 | 0.053 |
| 2972.0 | 0.064 | 0.054 |
| 2971.0 | 0.065 | 0.055 |
| 2970.0 | 0.065 | 0.056 |
| 2969.0 | 0.066 | 0.057 |
| 2968.0 | 0.067 | 0.058 |
| 2967.0 | 0.068 | 0.059 |
| 2966.0 | 0.069 | 0.061 |
| 2965.0 | 0.07 | 0.062 |
| 2964.0 | 0.07 | 0.063 |
| 2963.0 | 0.071 | 0.064 |
| 2962.0 | 0.072 | 0.065 |
| 2961.0 | 0.072 | 0.066 |
| 2960.0 | 0.073 | 0.067 |
| 2959.0 | 0.074 | 0.068 |
| 2958.0 | 0.074 | 0.068 |
| 2957.0 | 0.075 | 0.069 |
| 2956.0 | 0.075 | 0.069 |
| 2955.0 | 0.076 | 0.07 |
| 2954.0 | 0.076 | 0.07 |
| 2953.0 | 0.077 | 0.071 |
| 2952.0 | 0.077 | 0.071 |
| 2951.0 | 0.078 | 0.071 |
| 2950.0 | 0.078 | 0.072 |
| 2949.0 | 0.079 | 0.072 |
| 2948.0 | 0.08 | 0.073 |
| 2947.0 | 0.081 | 0.074 |
| 2946.0 | 0.082 | 0.075 |
| 2945.0 | 0.083 | 0.077 |
| 2944.0 | 0.084 | 0.078 |
| 2943.0 | 0.085 | 0.08 |
| 2942.0 | 0.087 | 0.082 |
| 2941.0 | 0.088 | 0.083 |
| 2940.0 | 0.089 | 0.085 |
| 2939.0 | 0.09 | 0.087 |
| 2938.0 | 0.092 | 0.089 |
| 2937.0 | 0.093 | 0.092 |
| 2936.0 | 0.095 | 0.094 |
| 2935.0 | 0.096 | 0.096 |
| 2934.0 | 0.097 | 0.099 |
| 2933.0 | 0.098 | 0.101 |
| 2932.0 | 0.1 | 0.103 |
| 2931.0 | 0.101 | 0.105 |
| 2930.0 | 0.102 | 0.107 |
| 2929.0 | 0.103 | 0.109 |
| 2928.0 | 0.104 | 0.111 |
| 2927.0 | 0.105 | 0.113 |
| 2926.0 | 0.106 | 0.115 |
| 2925.0 | 0.106 | 0.116 |
| 2924.0 | 0.107 | 0.116 |
| 2923.0 | 0.107 | 0.117 |
| 2922.0 | 0.107 | 0.117 |
| 2921.0 | 0.107 | 0.116 |
| 2920.0 | 0.106 | 0.115 |
| 2919.0 | 0.105 | 0.114 |
| 2918.0 | 0.104 | 0.112 |
| 2917.0 | 0.103 | 0.11 |
| 2916.0 | 0.101 | 0.107 |
| 2915.0 | 0.1 | 0.104 |
| 2914.0 | 0.098 | 0.101 |
| 2913.0 | 0.096 | 0.098 |
| 2912.0 | 0.094 | 0.096 |
| 2911.0 | 0.093 | 0.093 |
| 2910.0 | 0.091 | 0.09 |
| 2909.0 | 0.09 | 0.088 |
| 2908.0 | 0.089 | 0.087 |
| 2907.0 | 0.088 | 0.085 |
| 2906.0 | 0.087 | 0.084 |
| 2905.0 | 0.086 | 0.082 |
| 2904.0 | 0.085 | 0.081 |
| 2903.0 | 0.085 | 0.08 |
| 2902.0 | 0.084 | 0.079 |
| 2901.0 | 0.083 | 0.077 |
| 2900.0 | 0.083 | 0.077 |
| 2899.0 | 0.082 | 0.076 |
| 2898.0 | 0.081 | 0.075 |
| 2897.0 | 0.081 | 0.074 |
| 2896.0 | 0.08 | 0.073 |
| 2895.0 | 0.079 | 0.072 |
| 2894.0 | 0.079 | 0.071 |
| 2893.0 | 0.078 | 0.07 |
| 2892.0 | 0.078 | 0.069 |
| 2891.0 | 0.077 | 0.068 |
| 2890.0 | 0.077 | 0.068 |
| 2889.0 | 0.077 | 0.067 |
| 2888.0 | 0.076 | 0.067 |
| 2887.0 | 0.076 | 0.066 |
| 2886.0 | 0.075 | 0.065 |
| 2885.0 | 0.075 | 0.064 |
| 2884.0 | 0.074 | 0.064 |
| 2883.0 | 0.074 | 0.064 |
| 2882.0 | 0.074 | 0.063 |
| 2881.0 | 0.073 | 0.063 |
| 2880.0 | 0.073 | 0.063 |
| 2879.0 | 0.072 | 0.063 |
| 2878.0 | 0.072 | 0.063 |
| 2877.0 | 0.072 | 0.063 |
| 2876.0 | 0.072 | 0.063 |
| 2875.0 | 0.072 | 0.063 |
| 2874.0 | 0.072 | 0.064 |
| 2873.0 | 0.072 | 0.064 |
| 2872.0 | 0.071 | 0.064 |
| 2871.0 | 0.071 | 0.064 |
| 2870.0 | 0.07 | 0.064 |
| 2869.0 | 0.07 | 0.064 |
| 2868.0 | 0.07 | 0.064 |
| 2867.0 | 0.069 | 0.064 |
| 2866.0 | 0.069 | 0.064 |
| 2865.0 | 0.069 | 0.064 |
| 2864.0 | 0.069 | 0.065 |
| 2863.0 | 0.069 | 0.066 |
| 2862.0 | 0.069 | 0.068 |
| 2861.0 | 0.07 | 0.069 |
| 2860.0 | 0.07 | 0.071 |
| 2859.0 | 0.071 | 0.073 |
| 2858.0 | 0.071 | 0.074 |
| 2857.0 | 0.072 | 0.076 |
| 2856.0 | 0.072 | 0.078 |
| 2855.0 | 0.073 | 0.079 |
| 2854.0 | 0.073 | 0.08 |
| 2853.0 | 0.074 | 0.081 |
| 2852.0 | 0.073 | 0.08 |
| 2851.0 | 0.073 | 0.079 |
| 2850.0 | 0.071 | 0.077 |
| 2849.0 | 0.07 | 0.075 |
| 2848.0 | 0.068 | 0.072 |
| 2847.0 | 0.066 | 0.068 |
| 2846.0 | 0.064 | 0.065 |
| 2845.0 | 0.061 | 0.062 |
| 2844.0 | 0.059 | 0.059 |
| 2843.0 | 0.057 | 0.056 |
| 2842.0 | 0.056 | 0.054 |
| 2841.0 | 0.054 | 0.052 |
| 2840.0 | 0.053 | 0.05 |
| 2839.0 | 0.052 | 0.048 |
| 2838.0 | 0.051 | 0.047 |
| 2837.0 | 0.05 | 0.046 |
| 2836.0 | 0.049 | 0.044 |
| 2835.0 | 0.048 | 0.043 |
| 2834.0 | 0.047 | 0.042 |
| 2833.0 | 0.047 | 0.042 |
| 2832.0 | 0.046 | 0.041 |
| 2831.0 | 0.045 | 0.04 |
| 2830.0 | 0.045 | 0.039 |
| 2829.0 | 0.044 | 0.038 |
| 2828.0 | 0.043 | 0.038 |
| 2827.0 | 0.043 | 0.037 |
| 2826.0 | 0.042 | 0.037 |
| 2825.0 | 0.042 | 0.036 |
| 2824.0 | 0.041 | 0.036 |
| 2823.0 | 0.041 | 0.035 |
| 2822.0 | 0.04 | 0.035 |
| 2821.0 | 0.04 | 0.034 |
| 2820.0 | 0.039 | 0.034 |
| 2819.0 | 0.039 | 0.033 |
| 2818.0 | 0.039 | 0.033 |
| 2817.0 | 0.038 | 0.033 |
| 2816.0 | 0.038 | 0.033 |
| 2815.0 | 0.038 | 0.032 |
| 2814.0 | 0.037 | 0.032 |
| 2813.0 | 0.037 | 0.031 |
| 2812.0 | 0.037 | 0.031 |
| 2811.0 | 0.036 | 0.031 |
| 2810.0 | 0.036 | 0.03 |
| 2809.0 | 0.036 | 0.03 |
| 2808.0 | 0.035 | 0.03 |
| 2807.0 | 0.035 | 0.03 |
| 2806.0 | 0.035 | 0.03 |
| 2805.0 | 0.034 | 0.029 |
| 2804.0 | 0.034 | 0.029 |
| 2803.0 | 0.034 | 0.029 |
| 2802.0 | 0.034 | 0.029 |
| 2801.0 | 0.033 | 0.028 |
| 2800.0 | 0.033 | 0.028 |
| 2799.0 | 0.033 | 0.028 |
| 2798.0 | 0.033 | 0.028 |
| 2797.0 | 0.032 | 0.027 |
| 2796.0 | 0.032 | 0.027 |
| 2795.0 | 0.032 | 0.027 |
| 2794.0 | 0.031 | 0.027 |
| 2793.0 | 0.031 | 0.026 |
| 2792.0 | 0.031 | 0.026 |
| 2791.0 | 0.031 | 0.026 |
| 2790.0 | 0.031 | 0.026 |
| 2789.0 | 0.031 | 0.026 |
| 2788.0 | 0.03 | 0.026 |
| 2787.0 | 0.03 | 0.026 |
| 2786.0 | 0.03 | 0.025 |
| 2785.0 | 0.03 | 0.025 |
| 2784.0 | 0.03 | 0.025 |
| 2783.0 | 0.029 | 0.025 |
| 2782.0 | 0.029 | 0.025 |
| 2781.0 | 0.029 | 0.025 |
| 2780.0 | 0.029 | 0.025 |
| 2779.0 | 0.029 | 0.025 |
| 2778.0 | 0.029 | 0.025 |
| 2777.0 | 0.028 | 0.024 |
| 2776.0 | 0.028 | 0.024 |
| 2775.0 | 0.028 | 0.024 |
| 2774.0 | 0.028 | 0.024 |
| 2773.0 | 0.028 | 0.024 |
| 2772.0 | 0.028 | 0.024 |
| 2771.0 | 0.027 | 0.024 |
| 2770.0 | 0.027 | 0.024 |
| 2769.0 | 0.027 | 0.023 |
| 2768.0 | 0.027 | 0.023 |
| 2767.0 | 0.027 | 0.023 |
| 2766.0 | 0.027 | 0.023 |
| 2765.0 | 0.027 | 0.023 |
| 2764.0 | 0.026 | 0.023 |
| 2763.0 | 0.026 | 0.023 |
| 2762.0 | 0.026 | 0.023 |
| 2761.0 | 0.026 | 0.023 |
| 2760.0 | 0.026 | 0.023 |
| 2759.0 | 0.026 | 0.022 |
| 2758.0 | 0.026 | 0.022 |
| 2757.0 | 0.025 | 0.022 |
| 2756.0 | 0.025 | 0.022 |
| 2755.0 | 0.025 | 0.022 |
| 2754.0 | 0.025 | 0.022 |
| 2753.0 | 0.025 | 0.022 |
| 2752.0 | 0.025 | 0.022 |
| 2751.0 | 0.025 | 0.022 |
| 2750.0 | 0.025 | 0.022 |
| 2749.0 | 0.025 | 0.022 |
| 2748.0 | 0.025 | 0.022 |
| 2747.0 | 0.024 | 0.022 |
| 2746.0 | 0.024 | 0.021 |
| 2745.0 | 0.024 | 0.021 |
| 2744.0 | 0.024 | 0.021 |
| 2743.0 | 0.024 | 0.021 |
| 2742.0 | 0.024 | 0.021 |
| 2741.0 | 0.024 | 0.021 |
| 2740.0 | 0.024 | 0.021 |
| 2739.0 | 0.024 | 0.021 |
| 2738.0 | 0.024 | 0.021 |
| 2737.0 | 0.023 | 0.021 |
| 2736.0 | 0.023 | 0.021 |
| 2735.0 | 0.023 | 0.021 |
| 2734.0 | 0.023 | 0.021 |
| 2733.0 | 0.023 | 0.021 |
| 2732.0 | 0.023 | 0.021 |
| 2731.0 | 0.023 | 0.02 |
| 2730.0 | 0.023 | 0.02 |
| 2729.0 | 0.023 | 0.02 |
| 2728.0 | 0.023 | 0.02 |
| 2727.0 | 0.022 | 0.02 |
| 2726.0 | 0.022 | 0.02 |
| 2725.0 | 0.022 | 0.02 |
| 2724.0 | 0.022 | 0.02 |
| 2723.0 | 0.022 | 0.02 |
| 2722.0 | 0.022 | 0.02 |
| 2721.0 | 0.022 | 0.02 |
| 2720.0 | 0.022 | 0.02 |
| 2719.0 | 0.022 | 0.02 |
| 2718.0 | 0.022 | 0.02 |
| 2717.0 | 0.022 | 0.02 |
| 2716.0 | 0.021 | 0.019 |
| 2715.0 | 0.021 | 0.019 |
| 2714.0 | 0.021 | 0.019 |
| 2713.0 | 0.021 | 0.019 |
| 2712.0 | 0.021 | 0.019 |
| 2711.0 | 0.021 | 0.019 |
| 2710.0 | 0.021 | 0.019 |
| 2709.0 | 0.021 | 0.019 |
| 2708.0 | 0.021 | 0.019 |
| 2707.0 | 0.021 | 0.019 |
| 2706.0 | 0.02 | 0.019 |
| 2705.0 | 0.02 | 0.019 |
| 2704.0 | 0.02 | 0.019 |
| 2703.0 | 0.02 | 0.019 |
| 2702.0 | 0.02 | 0.019 |
| 2701.0 | 0.02 | 0.019 |
| 2700.0 | 0.02 | 0.018 |
| 2699.0 | 0.02 | 0.018 |
| 2698.0 | 0.02 | 0.018 |
| 2697.0 | 0.02 | 0.018 |
| 2696.0 | 0.019 | 0.018 |
| 2695.0 | 0.019 | 0.018 |
| 2694.0 | 0.019 | 0.018 |
| 2693.0 | 0.019 | 0.018 |
| 2692.0 | 0.019 | 0.018 |
| 2691.0 | 0.019 | 0.018 |
| 2690.0 | 0.019 | 0.018 |
| 2689.0 | 0.019 | 0.018 |
| 2688.0 | 0.019 | 0.018 |
| 2687.0 | 0.019 | 0.018 |
| 2686.0 | 0.019 | 0.018 |
| 2685.0 | 0.018 | 0.018 |
| 2684.0 | 0.018 | 0.018 |
| 2683.0 | 0.018 | 0.017 |
| 2682.0 | 0.018 | 0.017 |
| 2681.0 | 0.018 | 0.017 |
| 2680.0 | 0.018 | 0.017 |
| 2679.0 | 0.018 | 0.017 |
| 2678.0 | 0.018 | 0.017 |
| 2677.0 | 0.018 | 0.017 |
| 2676.0 | 0.017 | 0.017 |
| 2675.0 | 0.017 | 0.017 |
| 2674.0 | 0.017 | 0.017 |
| 2673.0 | 0.017 | 0.017 |
| 2672.0 | 0.017 | 0.017 |
| 2671.0 | 0.017 | 0.017 |
| 2670.0 | 0.017 | 0.017 |
| 2669.0 | 0.017 | 0.017 |
| 2668.0 | 0.017 | 0.017 |
| 2667.0 | 0.017 | 0.016 |
| 2666.0 | 0.016 | 0.016 |
| 2665.0 | 0.016 | 0.016 |
| 2664.0 | 0.016 | 0.016 |
| 2663.0 | 0.016 | 0.016 |
| 2662.0 | 0.016 | 0.016 |
| 2661.0 | 0.016 | 0.016 |
| 2660.0 | 0.016 | 0.016 |
| 2659.0 | 0.016 | 0.016 |
| 2658.0 | 0.016 | 0.016 |
| 2657.0 | 0.016 | 0.016 |
| 2656.0 | 0.016 | 0.016 |
| 2655.0 | 0.015 | 0.016 |
| 2654.0 | 0.015 | 0.016 |
| 2653.0 | 0.015 | 0.016 |
| 2652.0 | 0.015 | 0.016 |
| 2651.0 | 0.015 | 0.016 |
| 2650.0 | 0.015 | 0.016 |
| 2649.0 | 0.015 | 0.016 |
| 2648.0 | 0.015 | 0.016 |
| 2647.0 | 0.015 | 0.016 |
| 2646.0 | 0.015 | 0.015 |
| 2645.0 | 0.014 | 0.015 |
| 2644.0 | 0.014 | 0.015 |
| 2643.0 | 0.014 | 0.015 |
| 2642.0 | 0.014 | 0.015 |
| 2641.0 | 0.014 | 0.015 |
| 2640.0 | 0.014 | 0.015 |
| 2639.0 | 0.014 | 0.015 |
| 2638.0 | 0.014 | 0.015 |
| 2637.0 | 0.014 | 0.015 |
| 2636.0 | 0.014 | 0.015 |
| 2635.0 | 0.014 | 0.015 |
| 2634.0 | 0.014 | 0.015 |
| 2633.0 | 0.013 | 0.015 |
| 2632.0 | 0.013 | 0.015 |
| 2631.0 | 0.013 | 0.015 |
| 2630.0 | 0.013 | 0.015 |
| 2629.0 | 0.013 | 0.015 |
| 2628.0 | 0.013 | 0.015 |
| 2627.0 | 0.013 | 0.015 |
| 2626.0 | 0.013 | 0.015 |
| 2625.0 | 0.013 | 0.014 |
| 2624.0 | 0.013 | 0.014 |
| 2623.0 | 0.013 | 0.014 |
| 2622.0 | 0.012 | 0.014 |
| 2621.0 | 0.012 | 0.014 |
| 2620.0 | 0.012 | 0.014 |
| 2619.0 | 0.012 | 0.014 |
| 2618.0 | 0.012 | 0.014 |
| 2617.0 | 0.012 | 0.014 |
| 2616.0 | 0.012 | 0.014 |
| 2615.0 | 0.012 | 0.014 |
| 2614.0 | 0.012 | 0.014 |
| 2613.0 | 0.012 | 0.014 |
| 2612.0 | 0.012 | 0.014 |
| 2611.0 | 0.012 | 0.014 |
| 2610.0 | 0.011 | 0.014 |
| 2609.0 | 0.011 | 0.014 |
| 2608.0 | 0.011 | 0.014 |
| 2607.0 | 0.011 | 0.014 |
| 2606.0 | 0.011 | 0.013 |
| 2605.0 | 0.011 | 0.013 |
| 2604.0 | 0.011 | 0.013 |
| 2603.0 | 0.011 | 0.013 |
| 2602.0 | 0.011 | 0.013 |
| 2601.0 | 0.011 | 0.013 |
| 2600.0 | 0.011 | 0.013 |
| 2599.0 | 0.011 | 0.013 |
| 2598.0 | 0.011 | 0.013 |
| 2597.0 | 0.011 | 0.013 |
| 2596.0 | 0.01 | 0.013 |
| 2595.0 | 0.01 | 0.013 |
| 2594.0 | 0.01 | 0.013 |
| 2593.0 | 0.01 | 0.013 |
| 2592.0 | 0.01 | 0.013 |
| 2591.0 | 0.01 | 0.013 |
| 2590.0 | 0.01 | 0.013 |
| 2589.0 | 0.01 | 0.013 |
| 2588.0 | 0.01 | 0.013 |
| 2587.0 | 0.01 | 0.013 |
| 2586.0 | 0.01 | 0.012 |
| 2585.0 | 0.01 | 0.012 |
| 2584.0 | 0.01 | 0.012 |
| 2583.0 | 0.01 | 0.012 |
| 2582.0 | 0.009 | 0.012 |
| 2581.0 | 0.009 | 0.012 |
| 2580.0 | 0.009 | 0.012 |
| 2579.0 | 0.009 | 0.012 |
| 2578.0 | 0.009 | 0.012 |
| 2577.0 | 0.009 | 0.012 |
| 2576.0 | 0.009 | 0.012 |
| 2575.0 | 0.009 | 0.012 |
| 2574.0 | 0.009 | 0.012 |
| 2573.0 | 0.009 | 0.012 |
| 2572.0 | 0.009 | 0.012 |
| 2571.0 | 0.009 | 0.012 |
| 2570.0 | 0.009 | 0.012 |
| 2569.0 | 0.009 | 0.012 |
| 2568.0 | 0.009 | 0.012 |
| 2567.0 | 0.009 | 0.011 |
| 2566.0 | 0.009 | 0.011 |
| 2565.0 | 0.008 | 0.011 |
| 2564.0 | 0.008 | 0.011 |
| 2563.0 | 0.008 | 0.011 |
| 2562.0 | 0.008 | 0.011 |
| 2561.0 | 0.008 | 0.011 |
| 2560.0 | 0.008 | 0.011 |
| 2559.0 | 0.008 | 0.011 |
| 2558.0 | 0.008 | 0.011 |
| 2557.0 | 0.008 | 0.011 |
| 2556.0 | 0.008 | 0.011 |
| 2555.0 | 0.008 | 0.011 |
| 2554.0 | 0.008 | 0.011 |
| 2553.0 | 0.008 | 0.011 |
| 2552.0 | 0.008 | 0.011 |
| 2551.0 | 0.008 | 0.011 |
| 2550.0 | 0.008 | 0.011 |
| 2549.0 | 0.008 | 0.011 |
| 2548.0 | 0.008 | 0.011 |
| 2547.0 | 0.007 | 0.011 |
| 2546.0 | 0.007 | 0.011 |
| 2545.0 | 0.007 | 0.011 |
| 2544.0 | 0.007 | 0.01 |
| 2543.0 | 0.007 | 0.01 |
| 2542.0 | 0.007 | 0.01 |
| 2541.0 | 0.007 | 0.01 |
| 2540.0 | 0.007 | 0.01 |
| 2539.0 | 0.007 | 0.01 |
| 2538.0 | 0.007 | 0.01 |
| 2537.0 | 0.007 | 0.01 |
| 2536.0 | 0.007 | 0.01 |
| 2535.0 | 0.007 | 0.01 |
| 2534.0 | 0.007 | 0.01 |
| 2533.0 | 0.007 | 0.01 |
| 2532.0 | 0.007 | 0.01 |
| 2531.0 | 0.007 | 0.01 |
| 2530.0 | 0.007 | 0.01 |
| 2529.0 | 0.007 | 0.01 |
| 2528.0 | 0.007 | 0.01 |
| 2527.0 | 0.007 | 0.01 |
| 2526.0 | 0.007 | 0.01 |
| 2525.0 | 0.007 | 0.01 |
| 2524.0 | 0.007 | 0.01 |
| 2523.0 | 0.006 | 0.01 |
| 2522.0 | 0.006 | 0.01 |
| 2521.0 | 0.006 | 0.01 |
| 2520.0 | 0.006 | 0.01 |
| 2519.0 | 0.006 | 0.01 |
| 2518.0 | 0.006 | 0.01 |
| 2517.0 | 0.006 | 0.01 |
| 2516.0 | 0.006 | 0.009 |
| 2515.0 | 0.006 | 0.009 |
| 2514.0 | 0.006 | 0.009 |
| 2513.0 | 0.006 | 0.009 |
| 2512.0 | 0.006 | 0.009 |
| 2511.0 | 0.006 | 0.009 |
| 2510.0 | 0.006 | 0.009 |
| 2509.0 | 0.006 | 0.009 |
| 2508.0 | 0.006 | 0.009 |
| 2507.0 | 0.006 | 0.009 |
| 2506.0 | 0.006 | 0.009 |
| 2505.0 | 0.006 | 0.009 |
| 2504.0 | 0.006 | 0.009 |
| 2503.0 | 0.006 | 0.009 |
| 2502.0 | 0.006 | 0.009 |
| 2501.0 | 0.006 | 0.009 |
| 2500.0 | 0.006 | 0.009 |
| 2499.0 | 0.005 | 0.009 |
| 2498.0 | 0.005 | 0.009 |
| 2497.0 | 0.005 | 0.009 |
| 2496.0 | 0.005 | 0.009 |
| 2495.0 | 0.005 | 0.009 |
| 2494.0 | 0.005 | 0.009 |
| 2493.0 | 0.005 | 0.009 |
| 2492.0 | 0.005 | 0.009 |
| 2491.0 | 0.005 | 0.009 |
| 2490.0 | 0.005 | 0.009 |
| 2489.0 | 0.005 | 0.009 |
| 2488.0 | 0.005 | 0.008 |
| 2487.0 | 0.005 | 0.008 |
| 2486.0 | 0.005 | 0.008 |
| 2485.0 | 0.005 | 0.008 |
| 2484.0 | 0.005 | 0.008 |
| 2483.0 | 0.005 | 0.008 |
| 2482.0 | 0.005 | 0.008 |
| 2481.0 | 0.005 | 0.008 |
| 2480.0 | 0.005 | 0.008 |
| 2479.0 | 0.005 | 0.008 |
| 2478.0 | 0.005 | 0.008 |
| 2477.0 | 0.004 | 0.008 |
| 2476.0 | 0.004 | 0.008 |
| 2475.0 | 0.004 | 0.008 |
| 2474.0 | 0.004 | 0.008 |
| 2473.0 | 0.004 | 0.008 |
| 2472.0 | 0.004 | 0.008 |
| 2471.0 | 0.004 | 0.008 |
| 2470.0 | 0.004 | 0.008 |
| 2469.0 | 0.004 | 0.008 |
| 2468.0 | 0.004 | 0.008 |
| 2467.0 | 0.004 | 0.008 |
| 2466.0 | 0.004 | 0.008 |
| 2465.0 | 0.004 | 0.008 |
| 2464.0 | 0.004 | 0.007 |
| 2463.0 | 0.004 | 0.007 |
| 2462.0 | 0.004 | 0.007 |
| 2461.0 | 0.004 | 0.007 |
| 2460.0 | 0.004 | 0.007 |
| 2459.0 | 0.004 | 0.007 |
| 2458.0 | 0.004 | 0.007 |
| 2457.0 | 0.004 | 0.007 |
| 2456.0 | 0.004 | 0.007 |
| 2455.0 | 0.004 | 0.007 |
| 2454.0 | 0.003 | 0.007 |
| 2453.0 | 0.003 | 0.007 |
| 2452.0 | 0.003 | 0.007 |
| 2451.0 | 0.003 | 0.007 |
| 2450.0 | 0.003 | 0.007 |
| 2449.0 | 0.003 | 0.007 |
| 2448.0 | 0.003 | 0.007 |
| 2447.0 | 0.003 | 0.007 |
| 2446.0 | 0.003 | 0.007 |
| 2445.0 | 0.003 | 0.007 |
| 2444.0 | 0.003 | 0.007 |
| 2443.0 | 0.003 | 0.007 |
| 2442.0 | 0.003 | 0.007 |
| 2441.0 | 0.003 | 0.007 |
| 2440.0 | 0.003 | 0.007 |
| 2439.0 | 0.003 | 0.007 |
| 2438.0 | 0.003 | 0.007 |
| 2437.0 | 0.003 | 0.007 |
| 2436.0 | 0.002 | 0.007 |
| 2435.0 | 0.002 | 0.006 |
| 2434.0 | 0.002 | 0.006 |
| 2433.0 | 0.002 | 0.006 |
| 2432.0 | 0.002 | 0.006 |
| 2431.0 | 0.002 | 0.006 |
| 2430.0 | 0.002 | 0.006 |
| 2429.0 | 0.002 | 0.006 |
| 2428.0 | 0.002 | 0.006 |
| 2427.0 | 0.002 | 0.006 |
| 2426.0 | 0.002 | 0.006 |
| 2425.0 | 0.002 | 0.006 |
| 2424.0 | 0.002 | 0.006 |
| 2423.0 | 0.002 | 0.006 |
| 2422.0 | 0.002 | 0.006 |
| 2421.0 | 0.002 | 0.006 |
| 2420.0 | 0.002 | 0.006 |
| 2419.0 | 0.002 | 0.006 |
| 2418.0 | 0.002 | 0.006 |
| 2417.0 | 0.002 | 0.006 |
| 2416.0 | 0.002 | 0.006 |
| 2415.0 | 0.002 | 0.006 |
| 2414.0 | 0.001 | 0.006 |
| 2413.0 | 0.001 | 0.006 |
| 2412.0 | 0.001 | 0.006 |
| 2411.0 | 0.001 | 0.006 |
| 2410.0 | 0.001 | 0.006 |
| 2409.0 | 0.001 | 0.006 |
| 2408.0 | 0.001 | 0.005 |
| 2407.0 | 0.001 | 0.005 |
| 2406.0 | 0.001 | 0.005 |
| 2405.0 | 0.001 | 0.005 |
| 2404.0 | 0.001 | 0.005 |
| 2403.0 | 0.001 | 0.005 |
| 2402.0 | 0.001 | 0.005 |
| 2401.0 | 0.001 | 0.005 |
| 2400.0 | 0.001 | 0.005 |
| 2399.0 | 0.001 | 0.005 |
| 2398.0 | 0.001 | 0.005 |
| 2397.0 | 0.001 | 0.005 |
| 2396.0 | 0.001 | 0.005 |
| 2395.0 | 0.001 | 0.005 |
| 2394.0 | 0.001 | 0.005 |
| 2393.0 | 0.001 | 0.005 |
| 2392.0 | 0.001 | 0.005 |
| 2391.0 | 0.001 | 0.005 |
| 2390.0 | 0.001 | 0.005 |
| 2389.0 | 0.001 | 0.005 |
| 2388.0 | 0.001 | 0.005 |
| 2387.0 | 0.001 | 0.005 |
| 2386.0 | 0.001 | 0.005 |
| 2385.0 | 0.001 | 0.005 |
| 2384.0 | 0.001 | 0.005 |
| 2383.0 | 0.001 | 0.005 |
| 2382.0 | 0.001 | 0.005 |
| 2381.0 | 0.001 | 0.005 |
| 2380.0 | 0.001 | 0.005 |
| 2379.0 | 0.001 | 0.005 |
| 2378.0 | 0 | 0.005 |
| 2377.0 | 0 | 0.005 |
| 2376.0 | 0 | 0.005 |
| 2375.0 | 0 | 0.005 |
| 2374.0 | 0 | 0.005 |
| 2373.0 | 0 | 0.005 |
| 2372.0 | 0 | 0.005 |
| 2371.0 | 0 | 0.005 |
| 2370.0 | 0 | 0.005 |
| 2369.0 | 0 | 0.005 |
| 2368.0 | 0 | 0.005 |
| 2367.0 | 0 | 0.005 |
| 2366.0 | 0 | 0.005 |
| 2365.0 | 0 | 0.005 |
| 2364.0 | 0 | 0.005 |
| 2363.0 | 0 | 0.005 |
| 2362.0 | 0 | 0.005 |
| 2361.0 | 0 | 0.005 |
| 2360.0 | 0 | 0.005 |
| 2359.0 | 0 | 0.005 |
| 2358.0 | 0 | 0.005 |
| 2357.0 | 0 | 0.005 |
| 2356.0 | 0 | 0.005 |
| 2355.0 | 0 | 0.005 |
| 2354.0 | 0 | 0.005 |
| 2353.0 | 0.001 | 0.005 |
| 2352.0 | 0.001 | 0.005 |
| 2351.0 | 0.001 | 0.005 |
| 2350.0 | 0.001 | 0.005 |
| 2349.0 | 0.001 | 0.005 |
| 2348.0 | 0.001 | 0.005 |
| 2347.0 | 0.001 | 0.005 |
| 2346.0 | 0.001 | 0.005 |
| 2345.0 | 0.001 | 0.005 |
| 2344.0 | 0.001 | 0.005 |
| 2343.0 | 0.001 | 0.005 |
| 2342.0 | 0.001 | 0.005 |
| 2341.0 | 0.001 | 0.005 |
| 2340.0 | 0.001 | 0.005 |
| 2339.0 | 0.001 | 0.005 |
| 2338.0 | 0.001 | 0.005 |
| 2337.0 | 0.001 | 0.005 |
| 2336.0 | 0.001 | 0.005 |
| 2335.0 | 0.001 | 0.005 |
| 2334.0 | 0.001 | 0.005 |
| 2333.0 | 0.001 | 0.005 |
| 2332.0 | 0.001 | 0.005 |
| 2331.0 | 0.001 | 0.005 |
| 2330.0 | 0.001 | 0.005 |
| 2329.0 | 0.001 | 0.005 |
| 2328.0 | 0.001 | 0.005 |
| 2327.0 | 0.001 | 0.005 |
| 2326.0 | 0.001 | 0.005 |
| 2325.0 | 0.001 | 0.005 |
| 2324.0 | 0.001 | 0.005 |
| 2323.0 | 0.001 | 0.005 |
| 2322.0 | 0.001 | 0.005 |
| 2321.0 | 0.001 | 0.005 |
| 2320.0 | 0.001 | 0.005 |
| 2319.0 | 0.001 | 0.005 |
| 2318.0 | 0.001 | 0.005 |
| 2317.0 | 0.001 | 0.005 |
| 2316.0 | 0.001 | 0.005 |
| 2315.0 | 0.001 | 0.005 |
| 2314.0 | 0.001 | 0.005 |
| 2313.0 | 0.001 | 0.005 |
| 2312.0 | 0.001 | 0.005 |
| 2311.0 | 0.001 | 0.005 |
| 2310.0 | 0.001 | 0.005 |
| 2309.0 | 0.001 | 0.005 |
| 2308.0 | 0.001 | 0.005 |
| 2307.0 | 0.001 | 0.005 |
| 2306.0 | 0.001 | 0.005 |
| 2305.0 | 0.001 | 0.005 |
| 2304.0 | 0.001 | 0.005 |
| 2303.0 | 0.001 | 0.005 |
| 2302.0 | 0.001 | 0.005 |
| 2301.0 | 0.001 | 0.005 |
| 2300.0 | 0.001 | 0.005 |
| 2299.0 | 0.001 | 0.005 |
| 2298.0 | 0.001 | 0.005 |
| 2297.0 | 0.001 | 0.005 |
| 2296.0 | 0.001 | 0.005 |
| 2295.0 | 0.001 | 0.005 |
| 2294.0 | 0.001 | 0.005 |
| 2293.0 | 0.001 | 0.005 |
| 2292.0 | 0.001 | 0.005 |
| 2291.0 | 0.001 | 0.005 |
| 2290.0 | 0.001 | 0.005 |
| 2289.0 | 0.001 | 0.005 |
| 2288.0 | 0.001 | 0.005 |
| 2287.0 | 0.001 | 0.005 |
| 2286.0 | 0.001 | 0.005 |
| 2285.0 | 0.001 | 0.005 |
| 2284.0 | 0.001 | 0.005 |
| 2283.0 | 0.001 | 0.005 |
| 2282.0 | 0.001 | 0.005 |
| 2281.0 | 0.001 | 0.005 |
| 2280.0 | 0.001 | 0.005 |
| 2279.0 | 0.001 | 0.005 |
| 2278.0 | 0.001 | 0.005 |
| 2277.0 | 0.001 | 0.005 |
| 2276.0 | 0.001 | 0.005 |
| 2275.0 | 0.001 | 0.005 |
| 2274.0 | 0.001 | 0.005 |
| 2273.0 | 0.001 | 0.005 |
| 2272.0 | 0.001 | 0.005 |
| 2271.0 | 0.001 | 0.005 |
| 2270.0 | 0.001 | 0.005 |
| 2269.0 | 0.001 | 0.005 |
| 2268.0 | 0.001 | 0.005 |
| 2267.0 | 0.001 | 0.005 |
| 2266.0 | 0.001 | 0.005 |
| 2265.0 | 0.001 | 0.005 |
| 2264.0 | 0.001 | 0.005 |
| 2263.0 | 0.001 | 0.005 |
| 2262.0 | 0.001 | 0.005 |
| 2261.0 | 0.001 | 0.005 |
| 2260.0 | 0.001 | 0.005 |
| 2259.0 | 0.001 | 0.005 |
| 2258.0 | 0.001 | 0.005 |
| 2257.0 | 0.001 | 0.005 |
| 2256.0 | 0.001 | 0.005 |
| 2255.0 | 0.001 | 0.005 |
| 2254.0 | 0.001 | 0.005 |
| 2253.0 | 0.001 | 0.005 |
| 2252.0 | 0.001 | 0.005 |
| 2251.0 | 0.001 | 0.005 |
| 2250.0 | 0.001 | 0.005 |
| 2249.0 | 0.001 | 0.005 |
| 2248.0 | 0.001 | 0.005 |
| 2247.0 | 0.001 | 0.005 |
| 2246.0 | 0.001 | 0.005 |
| 2245.0 | 0.001 | 0.005 |
| 2244.0 | 0.001 | 0.005 |
| 2243.0 | 0.001 | 0.005 |
| 2242.0 | 0.001 | 0.005 |
| 2241.0 | 0.001 | 0.005 |
| 2240.0 | 0.001 | 0.005 |
| 2239.0 | 0.001 | 0.005 |
| 2238.0 | 0.001 | 0.005 |
| 2237.0 | 0.001 | 0.005 |
| 2236.0 | 0.001 | 0.005 |
| 2235.0 | 0.001 | 0.005 |
| 2234.0 | 0.001 | 0.005 |
| 2233.0 | 0.001 | 0.005 |
| 2232.0 | 0.001 | 0.005 |
| 2231.0 | 0.001 | 0.005 |
| 2230.0 | 0.001 | 0.005 |
| 2229.0 | 0.001 | 0.005 |
| 2228.0 | 0.001 | 0.005 |
| 2227.0 | 0.001 | 0.005 |
| 2226.0 | 0.001 | 0.005 |
| 2225.0 | 0.001 | 0.005 |
| 2224.0 | 0.001 | 0.005 |
| 2223.0 | 0.001 | 0.005 |
| 2222.0 | 0.001 | 0.005 |
| 2221.0 | 0.001 | 0.005 |
| 2220.0 | 0.001 | 0.005 |
| 2219.0 | 0.001 | 0.005 |
| 2218.0 | 0.001 | 0.005 |
| 2217.0 | 0.001 | 0.005 |
| 2216.0 | 0.001 | 0.005 |
| 2215.0 | 0.001 | 0.005 |
| 2214.0 | 0.001 | 0.005 |
| 2213.0 | 0.001 | 0.005 |
| 2212.0 | 0.001 | 0.005 |
| 2211.0 | 0.001 | 0.005 |
| 2210.0 | 0.001 | 0.005 |
| 2209.0 | 0.001 | 0.005 |
| 2208.0 | 0.002 | 0.005 |
| 2207.0 | 0.002 | 0.005 |
| 2206.0 | 0.002 | 0.005 |
| 2205.0 | 0.002 | 0.005 |
| 2204.0 | 0.002 | 0.005 |
| 2203.0 | 0.002 | 0.005 |
| 2202.0 | 0.002 | 0.005 |
| 2201.0 | 0.002 | 0.005 |
| 2200.0 | 0.002 | 0.005 |
| 2199.0 | 0.002 | 0.005 |
| 2198.0 | 0.002 | 0.005 |
| 2197.0 | 0.002 | 0.005 |
| 2196.0 | 0.002 | 0.005 |
| 2195.0 | 0.002 | 0.005 |
| 2194.0 | 0.002 | 0.005 |
| 2193.0 | 0.002 | 0.005 |
| 2192.0 | 0.002 | 0.005 |
| 2191.0 | 0.002 | 0.005 |
| 2190.0 | 0.003 | 0.005 |
| 2189.0 | 0.003 | 0.005 |
| 2188.0 | 0.003 | 0.005 |
| 2187.0 | 0.003 | 0.005 |
| 2186.0 | 0.002 | 0.005 |
| 2185.0 | 0.002 | 0.005 |
| 2184.0 | 0.002 | 0.005 |
| 2183.0 | 0.002 | 0.005 |
| 2182.0 | 0.002 | 0.005 |
| 2181.0 | 0.002 | 0.005 |
| 2180.0 | 0.002 | 0.005 |
| 2179.0 | 0.002 | 0.005 |
| 2178.0 | 0.002 | 0.005 |
| 2177.0 | 0.002 | 0.005 |
| 2176.0 | 0.002 | 0.005 |
| 2175.0 | 0.002 | 0.005 |
| 2174.0 | 0.002 | 0.005 |
| 2173.0 | 0.002 | 0.005 |
| 2172.0 | 0.002 | 0.005 |
| 2171.0 | 0.002 | 0.005 |
| 2170.0 | 0.002 | 0.005 |
| 2169.0 | 0.002 | 0.006 |
| 2168.0 | 0.002 | 0.006 |
| 2167.0 | 0.002 | 0.006 |
| 2166.0 | 0.002 | 0.006 |
| 2165.0 | 0.003 | 0.006 |
| 2164.0 | 0.003 | 0.006 |
| 2163.0 | 0.002 | 0.006 |
| 2162.0 | 0.002 | 0.006 |
| 2161.0 | 0.002 | 0.006 |
| 2160.0 | 0.002 | 0.005 |
| 2159.0 | 0.001 | 0.004 |
| 2158.0 | 0.001 | 0.004 |
| 2157.0 | 0.001 | 0.004 |
| 2156.0 | 0.001 | 0.004 |
| 2155.0 | 0.001 | 0.004 |
| 2154.0 | 0.001 | 0.004 |
| 2153.0 | 0.001 | 0.004 |
| 2152.0 | 0.001 | 0.004 |
| 2151.0 | 0.001 | 0.004 |
| 2150.0 | 0.001 | 0.004 |
| 2149.0 | 0.001 | 0.004 |
| 2148.0 | 0.001 | 0.004 |
| 2147.0 | 0.001 | 0.004 |
| 2146.0 | 0.001 | 0.004 |
| 2145.0 | 0.001 | 0.004 |
| 2144.0 | 0.001 | 0.004 |
| 2143.0 | 0.001 | 0.004 |
| 2142.0 | 0.001 | 0.004 |
| 2141.0 | 0.001 | 0.004 |
| 2140.0 | 0.001 | 0.004 |
| 2139.0 | 0.001 | 0.004 |
| 2138.0 | 0.001 | 0.004 |
| 2137.0 | 0.001 | 0.004 |
| 2136.0 | 0.001 | 0.004 |
| 2135.0 | 0.001 | 0.004 |
| 2134.0 | 0.001 | 0.004 |
| 2133.0 | 0.001 | 0.004 |
| 2132.0 | 0.001 | 0.004 |
| 2131.0 | 0.001 | 0.004 |
| 2130.0 | 0.001 | 0.004 |
| 2129.0 | 0.002 | 0.004 |
| 2128.0 | 0.002 | 0.004 |
| 2127.0 | 0.001 | 0.004 |
| 2126.0 | 0.001 | 0.005 |
| 2125.0 | 0.002 | 0.005 |
| 2124.0 | 0.002 | 0.005 |
| 2123.0 | 0.002 | 0.005 |
| 2122.0 | 0.002 | 0.005 |
| 2121.0 | 0.002 | 0.005 |
| 2120.0 | 0.002 | 0.005 |
| 2119.0 | 0.002 | 0.005 |
| 2118.0 | 0.002 | 0.005 |
| 2117.0 | 0.002 | 0.005 |
| 2116.0 | 0.002 | 0.005 |
| 2115.0 | 0.002 | 0.005 |
| 2114.0 | 0.002 | 0.005 |
| 2113.0 | 0.002 | 0.005 |
| 2112.0 | 0.002 | 0.005 |
| 2111.0 | 0.002 | 0.005 |
| 2110.0 | 0.002 | 0.005 |
| 2109.0 | 0.002 | 0.005 |
| 2108.0 | 0.002 | 0.005 |
| 2107.0 | 0.002 | 0.005 |
| 2106.0 | 0.002 | 0.005 |
| 2105.0 | 0.002 | 0.005 |
| 2104.0 | 0.002 | 0.005 |
| 2103.0 | 0.002 | 0.005 |
| 2102.0 | 0.002 | 0.005 |
| 2101.0 | 0.002 | 0.005 |
| 2100.0 | 0.002 | 0.005 |
| 2099.0 | 0.002 | 0.005 |
| 2098.0 | 0.002 | 0.005 |
| 2097.0 | 0.002 | 0.005 |
| 2096.0 | 0.002 | 0.005 |
| 2095.0 | 0.002 | 0.005 |
| 2094.0 | 0.002 | 0.005 |
| 2093.0 | 0.002 | 0.005 |
| 2092.0 | 0.002 | 0.005 |
| 2091.0 | 0.002 | 0.005 |
| 2090.0 | 0.002 | 0.005 |
| 2089.0 | 0.002 | 0.005 |
| 2088.0 | 0.002 | 0.005 |
| 2087.0 | 0.002 | 0.005 |
| 2086.0 | 0.002 | 0.005 |
| 2085.0 | 0.002 | 0.005 |
| 2084.0 | 0.002 | 0.005 |
| 2083.0 | 0.002 | 0.005 |
| 2082.0 | 0.002 | 0.005 |
| 2081.0 | 0.002 | 0.005 |
| 2080.0 | 0.002 | 0.005 |
| 2079.0 | 0.002 | 0.005 |
| 2078.0 | 0.002 | 0.005 |
| 2077.0 | 0.002 | 0.005 |
| 2076.0 | 0.002 | 0.005 |
| 2075.0 | 0.002 | 0.005 |
| 2074.0 | 0.002 | 0.005 |
| 2073.0 | 0.002 | 0.005 |
| 2072.0 | 0.002 | 0.005 |
| 2071.0 | 0.002 | 0.005 |
| 2070.0 | 0.002 | 0.005 |
| 2069.0 | 0.002 | 0.005 |
| 2068.0 | 0.001 | 0.005 |
| 2067.0 | 0.001 | 0.005 |
| 2066.0 | 0.001 | 0.005 |
| 2065.0 | 0.001 | 0.005 |
| 2064.0 | 0.001 | 0.005 |
| 2063.0 | 0.001 | 0.005 |
| 2062.0 | 0.001 | 0.005 |
| 2061.0 | 0.001 | 0.005 |
| 2060.0 | 0.001 | 0.005 |
| 2059.0 | 0.001 | 0.005 |
| 2058.0 | 0.001 | 0.005 |
| 2057.0 | 0.001 | 0.005 |
| 2056.0 | 0.001 | 0.005 |
| 2055.0 | 0.001 | 0.005 |
| 2054.0 | 0.001 | 0.005 |
| 2053.0 | 0.001 | 0.005 |
| 2052.0 | 0.001 | 0.005 |
| 2051.0 | 0.001 | 0.005 |
| 2050.0 | 0.001 | 0.005 |
| 2049.0 | 0.001 | 0.005 |
| 2048.0 | 0.001 | 0.005 |
| 2047.0 | 0.001 | 0.005 |
| 2046.0 | 0.001 | 0.004 |
| 2045.0 | 0.001 | 0.004 |
| 2044.0 | 0.001 | 0.004 |
| 2043.0 | 0.001 | 0.005 |
| 2042.0 | 0.001 | 0.005 |
| 2041.0 | 0.001 | 0.005 |
| 2040.0 | 0.001 | 0.005 |
| 2039.0 | 0.001 | 0.005 |
| 2038.0 | 0.001 | 0.005 |
| 2037.0 | 0.001 | 0.004 |
| 2036.0 | 0.001 | 0.004 |
| 2035.0 | 0.001 | 0.004 |
| 2034.0 | 0.001 | 0.004 |
| 2033.0 | 0 | 0.004 |
| 2032.0 | 0 | 0.004 |
| 2031.0 | 0 | 0.004 |
| 2030.0 | 0 | 0.004 |
| 2029.0 | 0 | 0.004 |
| 2028.0 | 0 | 0.004 |
| 2027.0 | 0 | 0.004 |
| 2026.0 | 0 | 0.004 |
| 2025.0 | 0 | 0.004 |
| 2024.0 | 0 | 0.004 |
| 2023.0 | 0 | 0.004 |
| 2022.0 | 0 | 0.004 |
| 2021.0 | 0 | 0.004 |
| 2020.0 | 0 | 0.004 |
| 2019.0 | 0 | 0.004 |
| 2018.0 | 0 | 0.004 |
| 2017.0 | 0 | 0.004 |
| 2016.0 | 0 | 0.004 |
| 2015.0 | 0 | 0.004 |
| 2014.0 | 0 | 0.004 |
| 2013.0 | 0 | 0.004 |
| 2012.0 | 0 | 0.004 |
| 2011.0 | 0 | 0.004 |
| 2010.0 | 0 | 0.004 |
| 2009.0 | 0 | 0.004 |
| 2008.0 | 0 | 0.003 |
| 2007.0 | 0 | 0.003 |
| 2006.0 | -0.001 | 0.003 |
| 2005.0 | -0.001 | 0.003 |
| 2004.0 | -0.001 | 0.003 |
| 2003.0 | -0.001 | 0.003 |
| 2002.0 | -0.001 | 0.003 |
| 2001.0 | -0.001 | 0.003 |
| 2000.0 | -0.001 | 0.003 |
| 1999.0 | -0.001 | 0.003 |
| 1998.0 | -0.001 | 0.003 |
| 1997.0 | -0.001 | 0.003 |
| 1996.0 | -0.001 | 0.003 |
| 1995.0 | -0.001 | 0.003 |
| 1994.0 | -0.001 | 0.003 |
| 1993.0 | -0.001 | 0.003 |
| 1992.0 | -0.001 | 0.003 |
| 1991.0 | -0.001 | 0.003 |
| 1990.0 | -0.001 | 0.003 |
| 1989.0 | -0.001 | 0.003 |
| 1988.0 | -0.001 | 0.003 |
| 1987.0 | -0.001 | 0.003 |
| 1986.0 | -0.001 | 0.003 |
| 1985.0 | -0.001 | 0.003 |
| 1984.0 | -0.001 | 0.003 |
| 1983.0 | -0.001 | 0.003 |
| 1982.0 | -0.001 | 0.003 |
| 1981.0 | -0.001 | 0.003 |
| 1980.0 | -0.001 | 0.003 |
| 1979.0 | -0.001 | 0.003 |
| 1978.0 | -0.001 | 0.003 |
| 1977.0 | -0.001 | 0.003 |
| 1976.0 | -0.002 | 0.003 |
| 1975.0 | -0.002 | 0.002 |
| 1974.0 | -0.002 | 0.002 |
| 1973.0 | -0.002 | 0.002 |
| 1972.0 | -0.002 | 0.002 |
| 1971.0 | -0.002 | 0.002 |
| 1970.0 | -0.002 | 0.002 |
| 1969.0 | -0.002 | 0.002 |
| 1968.0 | -0.002 | 0.002 |
| 1967.0 | -0.002 | 0.002 |
| 1966.0 | -0.002 | 0.002 |
| 1965.0 | -0.002 | 0.002 |
| 1964.0 | -0.002 | 0.002 |
| 1963.0 | -0.002 | 0.002 |
| 1962.0 | -0.002 | 0.002 |
| 1961.0 | -0.002 | 0.002 |
| 1960.0 | -0.002 | 0.002 |
| 1959.0 | -0.002 | 0.002 |
| 1958.0 | -0.002 | 0.002 |
| 1957.0 | -0.002 | 0.002 |
| 1956.0 | -0.002 | 0.002 |
| 1955.0 | -0.002 | 0.002 |
| 1954.0 | -0.002 | 0.002 |
| 1953.0 | -0.002 | 0.002 |
| 1952.0 | -0.002 | 0.002 |
| 1951.0 | -0.002 | 0.002 |
| 1950.0 | -0.002 | 0.002 |
| 1949.0 | -0.002 | 0.002 |
| 1948.0 | -0.002 | 0.002 |
| 1947.0 | -0.002 | 0.002 |
| 1946.0 | -0.002 | 0.002 |
| 1945.0 | -0.002 | 0.002 |
| 1944.0 | -0.002 | 0.002 |
| 1943.0 | -0.002 | 0.002 |
| 1942.0 | -0.002 | 0.002 |
| 1941.0 | -0.002 | 0.002 |
| 1940.0 | -0.002 | 0.002 |
| 1939.0 | -0.002 | 0.002 |
| 1938.0 | -0.002 | 0.002 |
| 1937.0 | -0.002 | 0.002 |
| 1936.0 | -0.002 | 0.002 |
| 1935.0 | -0.002 | 0.002 |
| 1934.0 | -0.002 | 0.002 |
| 1933.0 | -0.002 | 0.002 |
| 1932.0 | -0.002 | 0.002 |
| 1931.0 | -0.002 | 0.002 |
| 1930.0 | -0.002 | 0.002 |
| 1929.0 | -0.002 | 0.002 |
| 1928.0 | -0.002 | 0.002 |
| 1927.0 | -0.002 | 0.002 |
| 1926.0 | -0.002 | 0.002 |
| 1925.0 | -0.002 | 0.002 |
| 1924.0 | -0.002 | 0.002 |
| 1923.0 | -0.002 | 0.002 |
| 1922.0 | -0.002 | 0.002 |
| 1921.0 | -0.002 | 0.002 |
| 1920.0 | -0.002 | 0.002 |
| 1919.0 | -0.002 | 0.002 |
| 1918.0 | -0.002 | 0.002 |
| 1917.0 | -0.002 | 0.002 |
| 1916.0 | -0.002 | 0.002 |
| 1915.0 | -0.002 | 0.002 |
| 1914.0 | -0.002 | 0.002 |
| 1913.0 | -0.002 | 0.002 |
| 1912.0 | -0.002 | 0.002 |
| 1911.0 | -0.002 | 0.002 |
| 1910.0 | -0.002 | 0.001 |
| 1909.0 | -0.002 | 0.001 |
| 1908.0 | -0.002 | 0.001 |
| 1907.0 | -0.002 | 0.001 |
| 1906.0 | -0.002 | 0.001 |
| 1905.0 | -0.002 | 0.001 |
| 1904.0 | -0.002 | 0.001 |
| 1903.0 | -0.002 | 0.001 |
| 1902.0 | -0.002 | 0.001 |
| 1901.0 | -0.002 | 0.001 |
| 1900.0 | -0.002 | 0.001 |
| 1899.0 | -0.002 | 0.001 |
| 1898.0 | -0.002 | 0.001 |
| 1897.0 | -0.002 | 0.001 |
| 1896.0 | -0.002 | 0.001 |
| 1895.0 | -0.002 | 0.001 |
| 1894.0 | -0.002 | 0.001 |
| 1893.0 | -0.002 | 0.001 |
| 1892.0 | -0.002 | 0.001 |
| 1891.0 | -0.002 | 0.001 |
| 1890.0 | -0.002 | 0.001 |
| 1889.0 | -0.002 | 0.001 |
| 1888.0 | -0.002 | 0.001 |
| 1887.0 | -0.002 | 0.001 |
| 1886.0 | -0.002 | 0.001 |
| 1885.0 | -0.002 | 0.001 |
| 1884.0 | -0.002 | 0.001 |
| 1883.0 | -0.002 | 0.001 |
| 1882.0 | -0.002 | 0.001 |
| 1881.0 | -0.002 | 0.001 |
| 1880.0 | -0.002 | 0.001 |
| 1879.0 | -0.002 | 0.001 |
| 1878.0 | -0.002 | 0.001 |
| 1877.0 | -0.002 | 0.001 |
| 1876.0 | -0.002 | 0.001 |
| 1875.0 | -0.002 | 0.001 |
| 1874.0 | -0.002 | 0.001 |
| 1873.0 | -0.002 | 0.001 |
| 1872.0 | -0.002 | 0.001 |
| 1871.0 | -0.002 | 0.001 |
| 1870.0 | -0.002 | 0.001 |
| 1869.0 | -0.002 | 0.001 |
| 1868.0 | -0.002 | 0.001 |
| 1867.0 | -0.002 | 0.001 |
| 1866.0 | -0.002 | 0.001 |
| 1865.0 | -0.002 | 0.001 |
| 1864.0 | -0.002 | 0.001 |
| 1863.0 | -0.002 | 0.001 |
| 1862.0 | -0.002 | 0.001 |
| 1861.0 | -0.002 | 0.001 |
| 1860.0 | -0.002 | 0.001 |
| 1859.0 | -0.002 | 0.001 |
| 1858.0 | -0.002 | 0.001 |
| 1857.0 | -0.002 | 0.001 |
| 1856.0 | -0.002 | 0.001 |
| 1855.0 | -0.002 | 0.001 |
| 1854.0 | -0.002 | 0.001 |
| 1853.0 | -0.002 | 0.001 |
| 1852.0 | -0.002 | 0.001 |
| 1851.0 | -0.002 | 0.001 |
| 1850.0 | -0.002 | 0.001 |
| 1849.0 | -0.002 | 0.001 |
| 1848.0 | -0.002 | 0.001 |
| 1847.0 | -0.002 | 0.001 |
| 1846.0 | -0.002 | 0.001 |
| 1845.0 | -0.002 | 0.001 |
| 1844.0 | -0.002 | 0.001 |
| 1843.0 | -0.002 | 0.001 |
| 1842.0 | -0.002 | 0.001 |
| 1841.0 | -0.002 | 0.001 |
| 1840.0 | -0.002 | 0.001 |
| 1839.0 | -0.002 | 0.001 |
| 1838.0 | -0.002 | 0.001 |
| 1837.0 | -0.002 | 0.001 |
| 1836.0 | -0.002 | 0.001 |
| 1835.0 | -0.002 | 0.001 |
| 1834.0 | -0.002 | 0.001 |
| 1833.0 | -0.002 | 0.001 |
| 1832.0 | -0.002 | 0.001 |
| 1831.0 | -0.002 | 0.001 |
| 1830.0 | -0.002 | 0.001 |
| 1829.0 | -0.002 | 0.001 |
| 1828.0 | -0.002 | 0.001 |
| 1827.0 | -0.002 | 0.001 |
| 1826.0 | -0.002 | 0.001 |
| 1825.0 | -0.002 | 0.001 |
| 1824.0 | -0.002 | 0.001 |
| 1823.0 | -0.002 | 0.001 |
| 1822.0 | -0.002 | 0.001 |
| 1821.0 | -0.002 | 0.001 |
| 1820.0 | -0.002 | 0.001 |
| 1819.0 | -0.002 | 0.001 |
| 1818.0 | -0.002 | 0.001 |
| 1817.0 | -0.003 | 0.001 |
| 1816.0 | -0.002 | 0.001 |
| 1815.0 | -0.002 | 0.001 |
| 1814.0 | -0.003 | 0.001 |
| 1813.0 | -0.002 | 0.001 |
| 1812.0 | -0.002 | 0.001 |
| 1811.0 | -0.002 | 0.001 |
| 1810.0 | -0.002 | 0.001 |
| 1809.0 | -0.002 | 0.001 |
| 1808.0 | -0.002 | 0.001 |
| 1807.0 | -0.002 | 0.001 |
| 1806.0 | -0.002 | 0.001 |
| 1805.0 | -0.002 | 0.001 |
| 1804.0 | -0.002 | 0.001 |
| 1803.0 | -0.002 | 0.001 |
| 1802.0 | -0.003 | 0.001 |
| 1801.0 | -0.002 | 0.001 |
| 1800.0 | -0.002 | 0.001 |
| 1799.0 | -0.002 | 0.001 |
| 1798.0 | -0.002 | 0.001 |
| 1797.0 | -0.002 | 0.001 |
| 1796.0 | -0.002 | 0.001 |
| 1795.0 | -0.002 | 0.001 |
| 1794.0 | -0.002 | 0.001 |
| 1793.0 | -0.002 | 0.001 |
| 1792.0 | -0.002 | 0.001 |
| 1791.0 | -0.002 | 0.002 |
| 1790.0 | -0.002 | 0.002 |
| 1789.0 | -0.002 | 0.002 |
| 1788.0 | -0.002 | 0.002 |
| 1787.0 | -0.002 | 0.002 |
| 1786.0 | -0.002 | 0.002 |
| 1785.0 | -0.002 | 0.002 |
| 1784.0 | -0.002 | 0.002 |
| 1783.0 | -0.002 | 0.002 |
| 1782.0 | -0.002 | 0.002 |
| 1781.0 | -0.002 | 0.003 |
| 1780.0 | -0.002 | 0.003 |
| 1779.0 | -0.002 | 0.003 |
| 1778.0 | -0.002 | 0.003 |
| 1777.0 | -0.002 | 0.003 |
| 1776.0 | -0.001 | 0.003 |
| 1775.0 | -0.001 | 0.004 |
| 1774.0 | -0.001 | 0.004 |
| 1773.0 | -0.001 | 0.005 |
| 1772.0 | -0.001 | 0.005 |
| 1771.0 | -0.001 | 0.006 |
| 1770.0 | 0 | 0.006 |
| 1769.0 | 0 | 0.006 |
| 1768.0 | 0.001 | 0.007 |
| 1767.0 | 0.001 | 0.008 |
| 1766.0 | 0.001 | 0.009 |
| 1765.0 | 0.002 | 0.009 |
| 1764.0 | 0.003 | 0.01 |
| 1763.0 | 0.003 | 0.011 |
| 1762.0 | 0.004 | 0.013 |
| 1761.0 | 0.005 | 0.014 |
| 1760.0 | 0.006 | 0.016 |
| 1759.0 | 0.007 | 0.017 |
| 1758.0 | 0.008 | 0.019 |
| 1757.0 | 0.009 | 0.022 |
| 1756.0 | 0.011 | 0.025 |
| 1755.0 | 0.012 | 0.027 |
| 1754.0 | 0.014 | 0.029 |
| 1753.0 | 0.015 | 0.031 |
| 1752.0 | 0.017 | 0.034 |
| 1751.0 | 0.019 | 0.037 |
| 1750.0 | 0.021 | 0.041 |
| 1749.0 | 0.022 | 0.044 |
| 1748.0 | 0.024 | 0.047 |
| 1747.0 | 0.026 | 0.049 |
| 1746.0 | 0.027 | 0.051 |
| 1745.0 | 0.028 | 0.053 |
| 1744.0 | 0.029 | 0.054 |
| 1743.0 | 0.03 | 0.055 |
| 1742.0 | 0.031 | 0.056 |
| 1741.0 | 0.031 | 0.056 |
| 1740.0 | 0.031 | 0.056 |
| 1739.0 | 0.031 | 0.055 |
| 1738.0 | 0.03 | 0.054 |
| 1737.0 | 0.03 | 0.053 |
| 1736.0 | 0.03 | 0.052 |
| 1735.0 | 0.03 | 0.051 |
| 1734.0 | 0.029 | 0.049 |
| 1733.0 | 0.029 | 0.048 |
| 1732.0 | 0.029 | 0.048 |
| 1731.0 | 0.029 | 0.048 |
| 1730.0 | 0.029 | 0.048 |
| 1729.0 | 0.029 | 0.047 |
| 1728.0 | 0.029 | 0.047 |
| 1727.0 | 0.029 | 0.047 |
| 1726.0 | 0.029 | 0.046 |
| 1725.0 | 0.028 | 0.046 |
| 1724.0 | 0.028 | 0.046 |
| 1723.0 | 0.028 | 0.046 |
| 1722.0 | 0.028 | 0.046 |
| 1721.0 | 0.028 | 0.046 |
| 1720.0 | 0.028 | 0.046 |
| 1719.0 | 0.028 | 0.045 |
| 1718.0 | 0.028 | 0.045 |
| 1717.0 | 0.028 | 0.045 |
| 1716.0 | 0.029 | 0.046 |
| 1715.0 | 0.029 | 0.046 |
| 1714.0 | 0.03 | 0.047 |
| 1713.0 | 0.03 | 0.047 |
| 1712.0 | 0.03 | 0.047 |
| 1711.0 | 0.03 | 0.047 |
| 1710.0 | 0.03 | 0.047 |
| 1709.0 | 0.03 | 0.047 |
| 1708.0 | 0.03 | 0.047 |
| 1707.0 | 0.03 | 0.047 |
| 1706.0 | 0.031 | 0.046 |
| 1705.0 | 0.031 | 0.046 |
| 1704.0 | 0.032 | 0.046 |
| 1703.0 | 0.033 | 0.046 |
| 1702.0 | 0.033 | 0.047 |
| 1701.0 | 0.034 | 0.048 |
| 1700.0 | 0.035 | 0.048 |
| 1699.0 | 0.036 | 0.048 |
| 1698.0 | 0.038 | 0.048 |
| 1697.0 | 0.039 | 0.049 |
| 1696.0 | 0.041 | 0.051 |
| 1695.0 | 0.043 | 0.052 |
| 1694.0 | 0.045 | 0.054 |
| 1693.0 | 0.046 | 0.055 |
| 1692.0 | 0.048 | 0.056 |
| 1691.0 | 0.05 | 0.057 |
| 1690.0 | 0.052 | 0.058 |
| 1689.0 | 0.054 | 0.06 |
| 1688.0 | 0.056 | 0.061 |
| 1687.0 | 0.058 | 0.062 |
| 1686.0 | 0.06 | 0.064 |
| 1685.0 | 0.063 | 0.066 |
| 1684.0 | 0.066 | 0.069 |
| 1683.0 | 0.07 | 0.071 |
| 1682.0 | 0.072 | 0.072 |
| 1681.0 | 0.074 | 0.074 |
| 1680.0 | 0.076 | 0.076 |
| 1679.0 | 0.079 | 0.078 |
| 1678.0 | 0.081 | 0.079 |
| 1677.0 | 0.083 | 0.081 |
| 1676.0 | 0.086 | 0.084 |
| 1675.0 | 0.089 | 0.086 |
| 1674.0 | 0.092 | 0.088 |
| 1673.0 | 0.094 | 0.09 |
| 1672.0 | 0.097 | 0.092 |
| 1671.0 | 0.099 | 0.094 |
| 1670.0 | 0.103 | 0.096 |
| 1669.0 | 0.106 | 0.099 |
| 1668.0 | 0.109 | 0.101 |
| 1667.0 | 0.111 | 0.103 |
| 1666.0 | 0.114 | 0.105 |
| 1665.0 | 0.116 | 0.107 |
| 1664.0 | 0.119 | 0.109 |
| 1663.0 | 0.122 | 0.112 |
| 1662.0 | 0.124 | 0.114 |
| 1661.0 | 0.127 | 0.116 |
| 1660.0 | 0.129 | 0.118 |
| 1659.0 | 0.131 | 0.12 |
| 1658.0 | 0.133 | 0.121 |
| 1657.0 | 0.135 | 0.123 |
| 1656.0 | 0.137 | 0.124 |
| 1655.0 | 0.139 | 0.126 |
| 1654.0 | 0.141 | 0.127 |
| 1653.0 | 0.142 | 0.129 |
| 1652.0 | 0.143 | 0.129 |
| 1651.0 | 0.144 | 0.13 |
| 1650.0 | 0.144 | 0.131 |
| 1649.0 | 0.145 | 0.131 |
| 1648.0 | 0.146 | 0.132 |
| 1647.0 | 0.147 | 0.132 |
| 1646.0 | 0.147 | 0.132 |
| 1645.0 | 0.147 | 0.132 |
| 1644.0 | 0.147 | 0.133 |
| 1643.0 | 0.148 | 0.133 |
| 1642.0 | 0.148 | 0.133 |
| 1641.0 | 0.147 | 0.133 |
| 1640.0 | 0.147 | 0.133 |
| 1639.0 | 0.147 | 0.133 |
| 1638.0 | 0.147 | 0.133 |
| 1637.0 | 0.146 | 0.133 |
| 1636.0 | 0.145 | 0.132 |
| 1635.0 | 0.143 | 0.13 |
| 1634.0 | 0.142 | 0.129 |
| 1633.0 | 0.14 | 0.128 |
| 1632.0 | 0.139 | 0.127 |
| 1631.0 | 0.138 | 0.126 |
| 1630.0 | 0.136 | 0.124 |
| 1629.0 | 0.133 | 0.122 |
| 1628.0 | 0.131 | 0.12 |
| 1627.0 | 0.128 | 0.118 |
| 1626.0 | 0.125 | 0.116 |
| 1625.0 | 0.123 | 0.114 |
| 1624.0 | 0.12 | 0.111 |
| 1623.0 | 0.116 | 0.108 |
| 1622.0 | 0.113 | 0.105 |
| 1621.0 | 0.11 | 0.103 |
| 1620.0 | 0.108 | 0.102 |
| 1619.0 | 0.106 | 0.1 |
| 1618.0 | 0.104 | 0.098 |
| 1617.0 | 0.101 | 0.096 |
| 1616.0 | 0.098 | 0.094 |
| 1615.0 | 0.096 | 0.093 |
| 1614.0 | 0.095 | 0.092 |
| 1613.0 | 0.093 | 0.092 |
| 1612.0 | 0.092 | 0.091 |
| 1611.0 | 0.091 | 0.091 |
| 1610.0 | 0.09 | 0.091 |
| 1609.0 | 0.088 | 0.09 |
| 1608.0 | 0.087 | 0.089 |
| 1607.0 | 0.085 | 0.089 |
| 1606.0 | 0.084 | 0.087 |
| 1605.0 | 0.083 | 0.086 |
| 1604.0 | 0.081 | 0.085 |
| 1603.0 | 0.08 | 0.084 |
| 1602.0 | 0.079 | 0.083 |
| 1601.0 | 0.078 | 0.082 |
| 1600.0 | 0.077 | 0.082 |
| 1599.0 | 0.077 | 0.081 |
| 1598.0 | 0.077 | 0.081 |
| 1597.0 | 0.076 | 0.082 |
| 1596.0 | 0.076 | 0.082 |
| 1595.0 | 0.076 | 0.082 |
| 1594.0 | 0.075 | 0.081 |
| 1593.0 | 0.074 | 0.081 |
| 1592.0 | 0.073 | 0.079 |
| 1591.0 | 0.071 | 0.078 |
| 1590.0 | 0.069 | 0.076 |
| 1589.0 | 0.068 | 0.073 |
| 1588.0 | 0.065 | 0.071 |
| 1587.0 | 0.063 | 0.069 |
| 1586.0 | 0.062 | 0.066 |
| 1585.0 | 0.06 | 0.064 |
| 1584.0 | 0.058 | 0.062 |
| 1583.0 | 0.057 | 0.06 |
| 1582.0 | 0.055 | 0.058 |
| 1581.0 | 0.054 | 0.056 |
| 1580.0 | 0.053 | 0.055 |
| 1579.0 | 0.052 | 0.054 |
| 1578.0 | 0.052 | 0.053 |
| 1577.0 | 0.051 | 0.052 |
| 1576.0 | 0.05 | 0.051 |
| 1575.0 | 0.049 | 0.05 |
| 1574.0 | 0.049 | 0.05 |
| 1573.0 | 0.049 | 0.05 |
| 1572.0 | 0.049 | 0.05 |
| 1571.0 | 0.049 | 0.05 |
| 1570.0 | 0.049 | 0.05 |
| 1569.0 | 0.049 | 0.05 |
| 1568.0 | 0.049 | 0.05 |
| 1567.0 | 0.05 | 0.05 |
| 1566.0 | 0.05 | 0.051 |
| 1565.0 | 0.051 | 0.051 |
| 1564.0 | 0.051 | 0.052 |
| 1563.0 | 0.052 | 0.052 |
| 1562.0 | 0.053 | 0.052 |
| 1561.0 | 0.053 | 0.053 |
| 1560.0 | 0.054 | 0.055 |
| 1559.0 | 0.055 | 0.056 |
| 1558.0 | 0.057 | 0.058 |
| 1557.0 | 0.058 | 0.058 |
| 1556.0 | 0.059 | 0.059 |
| 1555.0 | 0.06 | 0.06 |
| 1554.0 | 0.061 | 0.06 |
| 1553.0 | 0.061 | 0.061 |
| 1552.0 | 0.062 | 0.062 |
| 1551.0 | 0.063 | 0.062 |
| 1550.0 | 0.063 | 0.063 |
| 1549.0 | 0.064 | 0.064 |
| 1548.0 | 0.064 | 0.064 |
| 1547.0 | 0.064 | 0.064 |
| 1546.0 | 0.064 | 0.065 |
| 1545.0 | 0.064 | 0.065 |
| 1544.0 | 0.064 | 0.065 |
| 1543.0 | 0.064 | 0.065 |
| 1542.0 | 0.064 | 0.065 |
| 1541.0 | 0.064 | 0.065 |
| 1540.0 | 0.063 | 0.064 |
| 1539.0 | 0.063 | 0.064 |
| 1538.0 | 0.062 | 0.063 |
| 1537.0 | 0.061 | 0.063 |
| 1536.0 | 0.061 | 0.063 |
| 1535.0 | 0.06 | 0.063 |
| 1534.0 | 0.059 | 0.062 |
| 1533.0 | 0.058 | 0.061 |
| 1532.0 | 0.057 | 0.06 |
| 1531.0 | 0.056 | 0.06 |
| 1530.0 | 0.055 | 0.059 |
| 1529.0 | 0.055 | 0.058 |
| 1528.0 | 0.054 | 0.058 |
| 1527.0 | 0.053 | 0.057 |
| 1526.0 | 0.052 | 0.057 |
| 1525.0 | 0.051 | 0.057 |
| 1524.0 | 0.051 | 0.057 |
| 1523.0 | 0.051 | 0.057 |
| 1522.0 | 0.052 | 0.058 |
| 1521.0 | 0.052 | 0.059 |
| 1520.0 | 0.053 | 0.061 |
| 1519.0 | 0.053 | 0.062 |
| 1518.0 | 0.054 | 0.064 |
| 1517.0 | 0.055 | 0.065 |
| 1516.0 | 0.055 | 0.066 |
| 1515.0 | 0.055 | 0.066 |
| 1514.0 | 0.054 | 0.066 |
| 1513.0 | 0.053 | 0.065 |
| 1512.0 | 0.052 | 0.065 |
| 1511.0 | 0.05 | 0.063 |
| 1510.0 | 0.049 | 0.062 |
| 1509.0 | 0.048 | 0.062 |
| 1508.0 | 0.047 | 0.061 |
| 1507.0 | 0.045 | 0.06 |
| 1506.0 | 0.043 | 0.058 |
| 1505.0 | 0.041 | 0.057 |
| 1504.0 | 0.04 | 0.055 |
| 1503.0 | 0.039 | 0.054 |
| 1502.0 | 0.037 | 0.052 |
| 1501.0 | 0.035 | 0.05 |
| 1500.0 | 0.033 | 0.048 |
| 1499.0 | 0.031 | 0.045 |
| 1498.0 | 0.029 | 0.042 |
| 1497.0 | 0.027 | 0.038 |
| 1496.0 | 0.024 | 0.035 |
| 1495.0 | 0.022 | 0.033 |
| 1494.0 | 0.02 | 0.031 |
| 1493.0 | 0.019 | 0.029 |
| 1492.0 | 0.018 | 0.027 |
| 1491.0 | 0.016 | 0.025 |
| 1490.0 | 0.015 | 0.023 |
| 1489.0 | 0.014 | 0.021 |
| 1488.0 | 0.014 | 0.02 |
| 1487.0 | 0.013 | 0.02 |
| 1486.0 | 0.013 | 0.019 |
| 1485.0 | 0.013 | 0.019 |
| 1484.0 | 0.014 | 0.019 |
| 1483.0 | 0.014 | 0.019 |
| 1482.0 | 0.015 | 0.019 |
| 1481.0 | 0.016 | 0.019 |
| 1480.0 | 0.017 | 0.02 |
| 1479.0 | 0.018 | 0.021 |
| 1478.0 | 0.019 | 0.022 |
| 1477.0 | 0.021 | 0.024 |
| 1476.0 | 0.023 | 0.026 |
| 1475.0 | 0.026 | 0.028 |
| 1474.0 | 0.029 | 0.031 |
| 1473.0 | 0.033 | 0.036 |
| 1472.0 | 0.037 | 0.041 |
| 1471.0 | 0.041 | 0.046 |
| 1470.0 | 0.044 | 0.05 |
| 1469.0 | 0.047 | 0.054 |
| 1468.0 | 0.05 | 0.057 |
| 1467.0 | 0.053 | 0.061 |
| 1466.0 | 0.056 | 0.063 |
| 1465.0 | 0.058 | 0.066 |
| 1464.0 | 0.06 | 0.068 |
| 1463.0 | 0.062 | 0.069 |
| 1462.0 | 0.062 | 0.069 |
| 1461.0 | 0.063 | 0.07 |
| 1460.0 | 0.064 | 0.07 |
| 1459.0 | 0.065 | 0.07 |
| 1458.0 | 0.066 | 0.071 |
| 1457.0 | 0.067 | 0.071 |
| 1456.0 | 0.067 | 0.071 |
| 1455.0 | 0.067 | 0.071 |
| 1454.0 | 0.067 | 0.07 |
| 1453.0 | 0.067 | 0.07 |
| 1452.0 | 0.066 | 0.069 |
| 1451.0 | 0.066 | 0.068 |
| 1450.0 | 0.065 | 0.066 |
| 1449.0 | 0.064 | 0.065 |
| 1448.0 | 0.063 | 0.064 |
| 1447.0 | 0.062 | 0.062 |
| 1446.0 | 0.061 | 0.061 |
| 1445.0 | 0.06 | 0.06 |
| 1444.0 | 0.06 | 0.058 |
| 1443.0 | 0.059 | 0.057 |
| 1442.0 | 0.058 | 0.056 |
| 1441.0 | 0.058 | 0.055 |
| 1440.0 | 0.058 | 0.054 |
| 1439.0 | 0.058 | 0.054 |
| 1438.0 | 0.058 | 0.054 |
| 1437.0 | 0.058 | 0.053 |
| 1436.0 | 0.058 | 0.053 |
| 1435.0 | 0.058 | 0.053 |
| 1434.0 | 0.058 | 0.053 |
| 1433.0 | 0.059 | 0.054 |
| 1432.0 | 0.06 | 0.054 |
| 1431.0 | 0.061 | 0.055 |
| 1430.0 | 0.061 | 0.056 |
| 1429.0 | 0.062 | 0.057 |
| 1428.0 | 0.063 | 0.058 |
| 1427.0 | 0.064 | 0.059 |
| 1426.0 | 0.065 | 0.059 |
| 1425.0 | 0.065 | 0.06 |
| 1424.0 | 0.066 | 0.061 |
| 1423.0 | 0.067 | 0.061 |
| 1422.0 | 0.067 | 0.062 |
| 1421.0 | 0.067 | 0.062 |
| 1420.0 | 0.067 | 0.061 |
| 1419.0 | 0.067 | 0.061 |
| 1418.0 | 0.066 | 0.06 |
| 1417.0 | 0.065 | 0.059 |
| 1416.0 | 0.065 | 0.058 |
| 1415.0 | 0.064 | 0.058 |
| 1414.0 | 0.063 | 0.056 |
| 1413.0 | 0.062 | 0.055 |
| 1412.0 | 0.061 | 0.054 |
| 1411.0 | 0.06 | 0.053 |
| 1410.0 | 0.059 | 0.052 |
| 1409.0 | 0.059 | 0.051 |
| 1408.0 | 0.058 | 0.05 |
| 1407.0 | 0.057 | 0.049 |
| 1406.0 | 0.056 | 0.048 |
| 1405.0 | 0.056 | 0.048 |
| 1404.0 | 0.055 | 0.047 |
| 1403.0 | 0.055 | 0.047 |
| 1402.0 | 0.054 | 0.047 |
| 1401.0 | 0.053 | 0.046 |
| 1400.0 | 0.053 | 0.046 |
| 1399.0 | 0.052 | 0.046 |
| 1398.0 | 0.052 | 0.045 |
| 1397.0 | 0.052 | 0.045 |
| 1396.0 | 0.052 | 0.045 |
| 1395.0 | 0.052 | 0.046 |
| 1394.0 | 0.052 | 0.046 |
| 1393.0 | 0.052 | 0.046 |
| 1392.0 | 0.052 | 0.047 |
| 1391.0 | 0.052 | 0.047 |
| 1390.0 | 0.053 | 0.047 |
| 1389.0 | 0.053 | 0.048 |
| 1388.0 | 0.053 | 0.048 |
| 1387.0 | 0.054 | 0.049 |
| 1386.0 | 0.054 | 0.05 |
| 1385.0 | 0.055 | 0.05 |
| 1384.0 | 0.056 | 0.051 |
| 1383.0 | 0.056 | 0.052 |
| 1382.0 | 0.057 | 0.053 |
| 1381.0 | 0.058 | 0.054 |
| 1380.0 | 0.059 | 0.055 |
| 1379.0 | 0.059 | 0.056 |
| 1378.0 | 0.06 | 0.056 |
| 1377.0 | 0.06 | 0.056 |
| 1376.0 | 0.06 | 0.056 |
| 1375.0 | 0.06 | 0.056 |
| 1374.0 | 0.061 | 0.056 |
| 1373.0 | 0.061 | 0.057 |
| 1372.0 | 0.061 | 0.057 |
| 1371.0 | 0.061 | 0.057 |
| 1370.0 | 0.061 | 0.056 |
| 1369.0 | 0.06 | 0.056 |
| 1368.0 | 0.06 | 0.056 |
| 1367.0 | 0.06 | 0.055 |
| 1366.0 | 0.059 | 0.054 |
| 1365.0 | 0.058 | 0.054 |
| 1364.0 | 0.058 | 0.053 |
| 1363.0 | 0.057 | 0.052 |
| 1362.0 | 0.056 | 0.051 |
| 1361.0 | 0.056 | 0.05 |
| 1360.0 | 0.055 | 0.05 |
| 1359.0 | 0.054 | 0.049 |
| 1358.0 | 0.053 | 0.048 |
| 1357.0 | 0.053 | 0.048 |
| 1356.0 | 0.052 | 0.047 |
| 1355.0 | 0.051 | 0.047 |
| 1354.0 | 0.051 | 0.046 |
| 1353.0 | 0.05 | 0.046 |
| 1352.0 | 0.05 | 0.046 |
| 1351.0 | 0.049 | 0.046 |
| 1350.0 | 0.049 | 0.045 |
| 1349.0 | 0.049 | 0.045 |
| 1348.0 | 0.049 | 0.045 |
| 1347.0 | 0.049 | 0.045 |
| 1346.0 | 0.049 | 0.046 |
| 1345.0 | 0.049 | 0.046 |
| 1344.0 | 0.049 | 0.046 |
| 1343.0 | 0.049 | 0.047 |
| 1342.0 | 0.05 | 0.047 |
| 1341.0 | 0.05 | 0.047 |
| 1340.0 | 0.05 | 0.048 |
| 1339.0 | 0.051 | 0.049 |
| 1338.0 | 0.051 | 0.049 |
| 1337.0 | 0.052 | 0.05 |
| 1336.0 | 0.052 | 0.051 |
| 1335.0 | 0.052 | 0.052 |
| 1334.0 | 0.052 | 0.052 |
| 1333.0 | 0.053 | 0.053 |
| 1332.0 | 0.053 | 0.053 |
| 1331.0 | 0.053 | 0.053 |
| 1330.0 | 0.052 | 0.053 |
| 1329.0 | 0.052 | 0.053 |
| 1328.0 | 0.052 | 0.053 |
| 1327.0 | 0.052 | 0.053 |
| 1326.0 | 0.051 | 0.053 |
| 1325.0 | 0.051 | 0.053 |
| 1324.0 | 0.051 | 0.053 |
| 1323.0 | 0.051 | 0.052 |
| 1322.0 | 0.051 | 0.052 |
| 1321.0 | 0.05 | 0.052 |
| 1320.0 | 0.05 | 0.052 |
| 1319.0 | 0.05 | 0.052 |
| 1318.0 | 0.05 | 0.052 |
| 1317.0 | 0.049 | 0.052 |
| 1316.0 | 0.049 | 0.052 |
| 1315.0 | 0.048 | 0.051 |
| 1314.0 | 0.047 | 0.051 |
| 1313.0 | 0.046 | 0.05 |
| 1312.0 | 0.045 | 0.049 |
| 1311.0 | 0.044 | 0.048 |
| 1310.0 | 0.043 | 0.047 |
| 1309.0 | 0.042 | 0.046 |
| 1308.0 | 0.04 | 0.045 |
| 1307.0 | 0.038 | 0.043 |
| 1306.0 | 0.037 | 0.042 |
| 1305.0 | 0.036 | 0.041 |
| 1304.0 | 0.034 | 0.04 |
| 1303.0 | 0.033 | 0.039 |
| 1302.0 | 0.032 | 0.038 |
| 1301.0 | 0.031 | 0.038 |
| 1300.0 | 0.031 | 0.037 |
| 1299.0 | 0.03 | 0.037 |
| 1298.0 | 0.03 | 0.037 |
| 1297.0 | 0.03 | 0.038 |
| 1296.0 | 0.03 | 0.038 |
| 1295.0 | 0.03 | 0.039 |
| 1294.0 | 0.03 | 0.04 |
| 1293.0 | 0.031 | 0.041 |
| 1292.0 | 0.032 | 0.042 |
| 1291.0 | 0.033 | 0.043 |
| 1290.0 | 0.034 | 0.045 |
| 1289.0 | 0.035 | 0.047 |
| 1288.0 | 0.036 | 0.048 |
| 1287.0 | 0.038 | 0.051 |
| 1286.0 | 0.039 | 0.053 |
| 1285.0 | 0.041 | 0.055 |
| 1284.0 | 0.043 | 0.057 |
| 1283.0 | 0.044 | 0.059 |
| 1282.0 | 0.046 | 0.061 |
| 1281.0 | 0.048 | 0.063 |
| 1280.0 | 0.049 | 0.065 |
| 1279.0 | 0.051 | 0.067 |
| 1278.0 | 0.052 | 0.069 |
| 1277.0 | 0.053 | 0.07 |
| 1276.0 | 0.055 | 0.072 |
| 1275.0 | 0.056 | 0.073 |
| 1274.0 | 0.057 | 0.074 |
| 1273.0 | 0.058 | 0.076 |
| 1272.0 | 0.059 | 0.077 |
| 1271.0 | 0.06 | 0.078 |
| 1270.0 | 0.061 | 0.079 |
| 1269.0 | 0.062 | 0.079 |
| 1268.0 | 0.062 | 0.08 |
| 1267.0 | 0.063 | 0.081 |
| 1266.0 | 0.063 | 0.081 |
| 1265.0 | 0.064 | 0.081 |
| 1264.0 | 0.064 | 0.081 |
| 1263.0 | 0.064 | 0.082 |
| 1262.0 | 0.065 | 0.082 |
| 1261.0 | 0.065 | 0.082 |
| 1260.0 | 0.066 | 0.083 |
| 1259.0 | 0.067 | 0.083 |
| 1258.0 | 0.067 | 0.084 |
| 1257.0 | 0.068 | 0.085 |
| 1256.0 | 0.069 | 0.085 |
| 1255.0 | 0.07 | 0.087 |
| 1254.0 | 0.071 | 0.088 |
| 1253.0 | 0.072 | 0.089 |
| 1252.0 | 0.073 | 0.091 |
| 1251.0 | 0.074 | 0.092 |
| 1250.0 | 0.075 | 0.094 |
| 1249.0 | 0.076 | 0.095 |
| 1248.0 | 0.077 | 0.097 |
| 1247.0 | 0.078 | 0.098 |
| 1246.0 | 0.079 | 0.1 |
| 1245.0 | 0.08 | 0.101 |
| 1244.0 | 0.08 | 0.102 |
| 1243.0 | 0.081 | 0.103 |
| 1242.0 | 0.081 | 0.104 |
| 1241.0 | 0.081 | 0.104 |
| 1240.0 | 0.081 | 0.105 |
| 1239.0 | 0.081 | 0.105 |
| 1238.0 | 0.08 | 0.105 |
| 1237.0 | 0.08 | 0.105 |
| 1236.0 | 0.079 | 0.104 |
| 1235.0 | 0.078 | 0.104 |
| 1234.0 | 0.077 | 0.103 |
| 1233.0 | 0.076 | 0.102 |
| 1232.0 | 0.075 | 0.101 |
| 1231.0 | 0.073 | 0.101 |
| 1230.0 | 0.072 | 0.099 |
| 1229.0 | 0.07 | 0.098 |
| 1228.0 | 0.069 | 0.097 |
| 1227.0 | 0.067 | 0.096 |
| 1226.0 | 0.066 | 0.094 |
| 1225.0 | 0.064 | 0.093 |
| 1224.0 | 0.062 | 0.091 |
| 1223.0 | 0.06 | 0.09 |
| 1222.0 | 0.059 | 0.088 |
| 1221.0 | 0.057 | 0.086 |
| 1220.0 | 0.055 | 0.084 |
| 1219.0 | 0.053 | 0.082 |
| 1218.0 | 0.051 | 0.08 |
| 1217.0 | 0.049 | 0.077 |
| 1216.0 | 0.047 | 0.075 |
| 1215.0 | 0.045 | 0.072 |
| 1214.0 | 0.043 | 0.07 |
| 1213.0 | 0.041 | 0.068 |
| 1212.0 | 0.039 | 0.065 |
| 1211.0 | 0.037 | 0.063 |
| 1210.0 | 0.036 | 0.061 |
| 1209.0 | 0.034 | 0.06 |
| 1208.0 | 0.033 | 0.058 |
| 1207.0 | 0.032 | 0.056 |
| 1206.0 | 0.03 | 0.055 |
| 1205.0 | 0.029 | 0.053 |
| 1204.0 | 0.027 | 0.052 |
| 1203.0 | 0.026 | 0.05 |
| 1202.0 | 0.024 | 0.049 |
| 1201.0 | 0.023 | 0.047 |
| 1200.0 | 0.021 | 0.046 |
| 1199.0 | 0.02 | 0.044 |
| 1198.0 | 0.018 | 0.043 |
| 1197.0 | 0.017 | 0.042 |
| 1196.0 | 0.016 | 0.041 |
| 1195.0 | 0.014 | 0.04 |
| 1194.0 | 0.013 | 0.039 |
| 1193.0 | 0.011 | 0.038 |
| 1192.0 | 0.01 | 0.037 |
| 1191.0 | 0.009 | 0.036 |
| 1190.0 | 0.008 | 0.036 |
| 1189.0 | 0.008 | 0.035 |
| 1188.0 | 0.007 | 0.035 |
| 1187.0 | 0.007 | 0.035 |
| 1186.0 | 0.007 | 0.035 |
| 1185.0 | 0.006 | 0.035 |
| 1184.0 | 0.006 | 0.036 |
| 1183.0 | 0.006 | 0.036 |
| 1182.0 | 0.007 | 0.037 |
| 1181.0 | 0.007 | 0.038 |
| 1180.0 | 0.008 | 0.038 |
| 1179.0 | 0.009 | 0.04 |
| 1178.0 | 0.01 | 0.041 |
| 1177.0 | 0.012 | 0.043 |
| 1176.0 | 0.014 | 0.045 |
| 1175.0 | 0.016 | 0.048 |
| 1174.0 | 0.018 | 0.051 |
| 1173.0 | 0.021 | 0.054 |
| 1172.0 | 0.025 | 0.058 |
| 1171.0 | 0.028 | 0.061 |
| 1170.0 | 0.032 | 0.065 |
| 1169.0 | 0.036 | 0.069 |
| 1168.0 | 0.04 | 0.073 |
| 1167.0 | 0.044 | 0.076 |
| 1166.0 | 0.048 | 0.08 |
| 1165.0 | 0.051 | 0.082 |
| 1164.0 | 0.055 | 0.085 |
| 1163.0 | 0.058 | 0.086 |
| 1162.0 | 0.06 | 0.087 |
| 1161.0 | 0.062 | 0.088 |
| 1160.0 | 0.064 | 0.088 |
| 1159.0 | 0.066 | 0.088 |
| 1158.0 | 0.067 | 0.088 |
| 1157.0 | 0.068 | 0.088 |
| 1156.0 | 0.069 | 0.088 |
| 1155.0 | 0.07 | 0.088 |
| 1154.0 | 0.071 | 0.088 |
| 1153.0 | 0.072 | 0.088 |
| 1152.0 | 0.074 | 0.087 |
| 1151.0 | 0.075 | 0.087 |
| 1150.0 | 0.076 | 0.087 |
| 1149.0 | 0.078 | 0.088 |
| 1148.0 | 0.079 | 0.088 |
| 1147.0 | 0.081 | 0.088 |
| 1146.0 | 0.082 | 0.088 |
| 1145.0 | 0.084 | 0.089 |
| 1144.0 | 0.086 | 0.089 |
| 1143.0 | 0.088 | 0.09 |
| 1142.0 | 0.09 | 0.091 |
| 1141.0 | 0.091 | 0.092 |
| 1140.0 | 0.093 | 0.093 |
| 1139.0 | 0.095 | 0.095 |
| 1138.0 | 0.097 | 0.096 |
| 1137.0 | 0.1 | 0.099 |
| 1136.0 | 0.103 | 0.102 |
| 1135.0 | 0.106 | 0.105 |
| 1134.0 | 0.109 | 0.109 |
| 1133.0 | 0.112 | 0.112 |
| 1132.0 | 0.116 | 0.116 |
| 1131.0 | 0.119 | 0.12 |
| 1130.0 | 0.122 | 0.124 |
| 1129.0 | 0.125 | 0.127 |
| 1128.0 | 0.128 | 0.131 |
| 1127.0 | 0.131 | 0.134 |
| 1126.0 | 0.133 | 0.137 |
| 1125.0 | 0.136 | 0.14 |
| 1124.0 | 0.138 | 0.142 |
| 1123.0 | 0.14 | 0.144 |
| 1122.0 | 0.142 | 0.145 |
| 1121.0 | 0.143 | 0.147 |
| 1120.0 | 0.145 | 0.148 |
| 1119.0 | 0.146 | 0.149 |
| 1118.0 | 0.148 | 0.15 |
| 1117.0 | 0.15 | 0.151 |
| 1116.0 | 0.152 | 0.153 |
| 1115.0 | 0.155 | 0.154 |
| 1114.0 | 0.157 | 0.156 |
| 1113.0 | 0.159 | 0.157 |
| 1112.0 | 0.161 | 0.158 |
| 1111.0 | 0.163 | 0.159 |
| 1110.0 | 0.165 | 0.16 |
| 1109.0 | 0.166 | 0.161 |
| 1108.0 | 0.168 | 0.162 |
| 1107.0 | 0.169 | 0.162 |
| 1106.0 | 0.17 | 0.163 |
| 1105.0 | 0.171 | 0.164 |
| 1104.0 | 0.171 | 0.164 |
| 1103.0 | 0.171 | 0.165 |
| 1102.0 | 0.17 | 0.164 |
| 1101.0 | 0.169 | 0.164 |
| 1100.0 | 0.168 | 0.164 |
| 1099.0 | 0.167 | 0.163 |
| 1098.0 | 0.165 | 0.162 |
| 1097.0 | 0.163 | 0.161 |
| 1096.0 | 0.162 | 0.16 |
| 1095.0 | 0.16 | 0.159 |
| 1094.0 | 0.159 | 0.158 |
| 1093.0 | 0.158 | 0.157 |
| 1092.0 | 0.158 | 0.157 |
| 1091.0 | 0.158 | 0.157 |
| 1090.0 | 0.159 | 0.157 |
| 1089.0 | 0.161 | 0.157 |
| 1088.0 | 0.164 | 0.158 |
| 1087.0 | 0.167 | 0.159 |
| 1086.0 | 0.171 | 0.16 |
| 1085.0 | 0.175 | 0.161 |
| 1084.0 | 0.18 | 0.163 |
| 1083.0 | 0.185 | 0.165 |
| 1082.0 | 0.189 | 0.167 |
| 1081.0 | 0.194 | 0.169 |
| 1080.0 | 0.199 | 0.171 |
| 1079.0 | 0.203 | 0.173 |
| 1078.0 | 0.208 | 0.175 |
| 1077.0 | 0.212 | 0.177 |
| 1076.0 | 0.216 | 0.179 |
| 1075.0 | 0.219 | 0.181 |
| 1074.0 | 0.222 | 0.182 |
| 1073.0 | 0.225 | 0.184 |
| 1072.0 | 0.228 | 0.186 |
| 1071.0 | 0.231 | 0.187 |
| 1070.0 | 0.235 | 0.189 |
| 1069.0 | 0.238 | 0.192 |
| 1068.0 | 0.242 | 0.194 |
| 1067.0 | 0.247 | 0.197 |
| 1066.0 | 0.251 | 0.201 |
| 1065.0 | 0.257 | 0.205 |
| 1064.0 | 0.263 | 0.209 |
| 1063.0 | 0.269 | 0.214 |
| 1062.0 | 0.276 | 0.219 |
| 1061.0 | 0.284 | 0.224 |
| 1060.0 | 0.291 | 0.229 |
| 1059.0 | 0.298 | 0.233 |
| 1058.0 | 0.305 | 0.237 |
| 1057.0 | 0.311 | 0.241 |
| 1056.0 | 0.318 | 0.245 |
| 1055.0 | 0.324 | 0.249 |
| 1054.0 | 0.33 | 0.252 |
| 1053.0 | 0.336 | 0.255 |
| 1052.0 | 0.341 | 0.258 |
| 1051.0 | 0.345 | 0.261 |
| 1050.0 | 0.349 | 0.262 |
| 1049.0 | 0.352 | 0.264 |
| 1048.0 | 0.355 | 0.265 |
| 1047.0 | 0.357 | 0.266 |
| 1046.0 | 0.359 | 0.267 |
| 1045.0 | 0.36 | 0.267 |
| 1044.0 | 0.362 | 0.268 |
| 1043.0 | 0.363 | 0.269 |
| 1042.0 | 0.365 | 0.27 |
| 1041.0 | 0.367 | 0.271 |
| 1040.0 | 0.369 | 0.273 |
| 1039.0 | 0.371 | 0.274 |
| 1038.0 | 0.374 | 0.276 |
| 1037.0 | 0.376 | 0.278 |
| 1036.0 | 0.379 | 0.28 |
| 1035.0 | 0.382 | 0.282 |
| 1034.0 | 0.383 | 0.284 |
| 1033.0 | 0.384 | 0.285 |
| 1032.0 | 0.385 | 0.285 |
| 1031.0 | 0.384 | 0.285 |
| 1030.0 | 0.383 | 0.283 |
| 1029.0 | 0.381 | 0.282 |
| 1028.0 | 0.379 | 0.28 |
| 1027.0 | 0.376 | 0.277 |
| 1026.0 | 0.372 | 0.274 |
| 1025.0 | 0.368 | 0.271 |
| 1024.0 | 0.363 | 0.268 |
| 1023.0 | 0.359 | 0.265 |
| 1022.0 | 0.354 | 0.261 |
| 1021.0 | 0.35 | 0.258 |
| 1020.0 | 0.346 | 0.254 |
| 1019.0 | 0.342 | 0.251 |
| 1018.0 | 0.339 | 0.248 |
| 1017.0 | 0.335 | 0.245 |
| 1016.0 | 0.332 | 0.241 |
| 1015.0 | 0.328 | 0.238 |
| 1014.0 | 0.325 | 0.235 |
| 1013.0 | 0.321 | 0.232 |
| 1012.0 | 0.317 | 0.229 |
| 1011.0 | 0.313 | 0.226 |
| 1010.0 | 0.309 | 0.223 |
| 1009.0 | 0.305 | 0.22 |
| 1008.0 | 0.301 | 0.217 |
| 1007.0 | 0.298 | 0.215 |
| 1006.0 | 0.296 | 0.212 |
| 1005.0 | 0.294 | 0.21 |
| 1004.0 | 0.293 | 0.208 |
| 1003.0 | 0.292 | 0.206 |
| 1002.0 | 0.292 | 0.205 |
| 1001.0 | 0.292 | 0.204 |
| 1000.0 | 0.292 | 0.202 |
| 999.0 | 0.292 | 0.201 |
| 998.0 | 0.293 | 0.2 |
| 997.0 | 0.293 | 0.199 |
| 996.0 | 0.293 | 0.198 |
| 995.0 | 0.294 | 0.197 |
| 994.0 | 0.294 | 0.196 |
| 993.0 | 0.295 | 0.196 |
| 992.0 | 0.295 | 0.195 |
| 991.0 | 0.295 | 0.194 |
| 990.0 | 0.293 | 0.193 |
| 989.0 | 0.291 | 0.192 |
| 988.0 | 0.288 | 0.19 |
| 987.0 | 0.284 | 0.188 |
| 986.0 | 0.279 | 0.186 |
| 985.0 | 0.272 | 0.183 |
| 984.0 | 0.264 | 0.179 |
| 983.0 | 0.255 | 0.175 |
| 982.0 | 0.245 | 0.171 |
| 981.0 | 0.235 | 0.165 |
| 980.0 | 0.224 | 0.16 |
| 979.0 | 0.213 | 0.155 |
| 978.0 | 0.202 | 0.149 |
| 977.0 | 0.191 | 0.144 |
| 976.0 | 0.181 | 0.138 |
| 975.0 | 0.171 | 0.133 |
| 974.0 | 0.162 | 0.128 |
| 973.0 | 0.153 | 0.124 |
| 972.0 | 0.145 | 0.119 |
| 971.0 | 0.137 | 0.115 |
| 970.0 | 0.13 | 0.111 |
| 969.0 | 0.123 | 0.107 |
| 968.0 | 0.117 | 0.103 |
| 967.0 | 0.111 | 0.099 |
| 966.0 | 0.105 | 0.096 |
| 965.0 | 0.1 | 0.092 |
| 964.0 | 0.095 | 0.089 |
| 963.0 | 0.09 | 0.086 |
| 962.0 | 0.085 | 0.083 |
| 961.0 | 0.081 | 0.079 |
| 960.0 | 0.077 | 0.076 |
| 959.0 | 0.073 | 0.073 |
| 958.0 | 0.07 | 0.07 |
| 957.0 | 0.066 | 0.068 |
| 956.0 | 0.064 | 0.065 |
| 955.0 | 0.061 | 0.063 |
| 954.0 | 0.059 | 0.06 |
| 953.0 | 0.057 | 0.058 |
| 952.0 | 0.055 | 0.056 |
| 951.0 | 0.054 | 0.055 |
| 950.0 | 0.053 | 0.053 |
| 949.0 | 0.052 | 0.052 |
| 948.0 | 0.052 | 0.05 |
| 947.0 | 0.051 | 0.049 |
| 946.0 | 0.051 | 0.048 |
| 945.0 | 0.05 | 0.047 |
| 944.0 | 0.05 | 0.046 |
| 943.0 | 0.05 | 0.045 |
| 942.0 | 0.05 | 0.044 |
| 941.0 | 0.05 | 0.043 |
| 940.0 | 0.05 | 0.042 |
| 939.0 | 0.05 | 0.042 |
| 938.0 | 0.05 | 0.041 |
| 937.0 | 0.051 | 0.04 |
| 936.0 | 0.051 | 0.04 |
| 935.0 | 0.051 | 0.039 |
| 934.0 | 0.052 | 0.039 |
| 933.0 | 0.052 | 0.039 |
| 932.0 | 0.053 | 0.038 |
| 931.0 | 0.053 | 0.038 |
| 930.0 | 0.054 | 0.038 |
| 929.0 | 0.054 | 0.038 |
| 928.0 | 0.054 | 0.037 |
| 927.0 | 0.054 | 0.037 |
| 926.0 | 0.054 | 0.036 |
| 925.0 | 0.053 | 0.036 |
| 924.0 | 0.052 | 0.035 |
| 923.0 | 0.051 | 0.035 |
| 922.0 | 0.05 | 0.034 |
| 921.0 | 0.048 | 0.033 |
| 920.0 | 0.047 | 0.032 |
| 919.0 | 0.044 | 0.031 |
| 918.0 | 0.042 | 0.03 |
| 917.0 | 0.04 | 0.029 |
| 916.0 | 0.037 | 0.027 |
| 915.0 | 0.035 | 0.026 |
| 914.0 | 0.032 | 0.025 |
| 913.0 | 0.03 | 0.024 |
| 912.0 | 0.028 | 0.023 |
| 911.0 | 0.026 | 0.022 |
| 910.0 | 0.025 | 0.021 |
| 909.0 | 0.023 | 0.02 |
| 908.0 | 0.022 | 0.02 |
| 907.0 | 0.021 | 0.019 |
| 906.0 | 0.021 | 0.019 |
| 905.0 | 0.02 | 0.019 |
| 904.0 | 0.02 | 0.019 |
| 903.0 | 0.02 | 0.02 |
| 902.0 | 0.02 | 0.02 |
| 901.0 | 0.019 | 0.02 |
| 900.0 | 0.019 | 0.02 |
| 899.0 | 0.019 | 0.02 |
| 898.0 | 0.018 | 0.02 |
| 897.0 | 0.017 | 0.019 |
| 896.0 | 0.016 | 0.019 |
| 895.0 | 0.015 | 0.018 |
| 894.0 | 0.013 | 0.017 |
| 893.0 | 0.012 | 0.016 |
| 892.0 | 0.01 | 0.014 |
| 891.0 | 0.008 | 0.013 |
| 890.0 | 0.006 | 0.011 |
| 889.0 | 0.005 | 0.01 |
| 888.0 | 0.003 | 0.009 |
| 887.0 | 0.002 | 0.008 |
| 886.0 | 0.001 | 0.007 |
| 885.0 | 0 | 0.006 |
| 884.0 | -0.001 | 0.005 |
| 883.0 | -0.002 | 0.004 |
| 882.0 | -0.002 | 0.003 |
| 881.0 | -0.003 | 0.003 |
| 880.0 | -0.003 | 0.002 |
| 879.0 | -0.003 | 0.002 |
| 878.0 | -0.002 | 0.002 |
| 877.0 | -0.002 | 0.002 |
| 876.0 | -0.002 | 0.002 |
| 875.0 | -0.001 | 0.002 |
| 874.0 | -0.001 | 0.002 |
| 873.0 | -0.001 | 0.002 |
| 872.0 | -0.001 | 0.002 |
| 871.0 | -0.001 | 0.001 |
| 870.0 | -0.001 | 0.001 |
| 869.0 | -0.001 | 0.001 |
| 868.0 | -0.001 | 0.001 |
| 867.0 | -0.002 | 0.001 |
| 866.0 | -0.002 | 0.001 |
| 865.0 | -0.002 | 0.001 |
| 864.0 | -0.002 | 0.001 |
| 863.0 | -0.003 | 0.001 |
| 862.0 | -0.002 | 0.001 |
| 861.0 | -0.002 | 0.002 |
| 860.0 | -0.002 | 0.002 |
| 859.0 | -0.002 | 0.003 |
| 858.0 | -0.001 | 0.004 |
| 857.0 | -0.001 | 0.005 |
| 856.0 | 0 | 0.006 |
| 855.0 | 0.001 | 0.006 |
| 854.0 | 0.001 | 0.007 |
| 853.0 | 0.001 | 0.007 |
| 852.0 | 0.002 | 0.007 |
| 851.0 | 0.002 | 0.007 |
| 850.0 | 0.001 | 0.007 |
| 849.0 | 0.001 | 0.007 |
| 848.0 | 0.001 | 0.006 |
| 847.0 | 0.001 | 0.006 |
| 846.0 | 0 | 0.006 |
| 845.0 | 0 | 0.005 |
| 844.0 | 0 | 0.005 |
| 843.0 | 0 | 0.005 |
| 842.0 | 0 | 0.005 |
| 841.0 | 0.001 | 0.005 |
| 840.0 | 0.001 | 0.006 |
| 839.0 | 0.001 | 0.006 |
| 838.0 | 0.002 | 0.006 |
| 837.0 | 0.002 | 0.006 |
| 836.0 | 0.002 | 0.007 |
| 835.0 | 0.003 | 0.007 |
| 834.0 | 0.004 | 0.008 |
| 833.0 | 0.004 | 0.008 |
| 832.0 | 0.004 | 0.008 |
| 831.0 | 0.004 | 0.008 |
| 830.0 | 0.004 | 0.007 |
| 829.0 | 0.003 | 0.007 |
| 828.0 | 0.003 | 0.007 |
| 827.0 | 0.002 | 0.006 |
| 826.0 | 0.002 | 0.006 |
| 825.0 | 0.001 | 0.006 |
| 824.0 | 0.001 | 0.005 |
| 823.0 | 0 | 0.005 |
| 822.0 | 0 | 0.004 |
| 821.0 | -0.001 | 0.004 |
| 820.0 | -0.001 | 0.004 |
| 819.0 | -0.001 | 0.003 |
| 818.0 | -0.002 | 0.003 |
| 817.0 | -0.002 | 0.003 |
| 816.0 | -0.001 | 0.003 |
| 815.0 | -0.002 | 0.003 |
| 814.0 | -0.002 | 0.003 |
| 813.0 | -0.002 | 0.003 |
| 812.0 | -0.002 | 0.003 |
| 811.0 | -0.002 | 0.003 |
| 810.0 | -0.002 | 0.003 |
| 809.0 | -0.002 | 0.003 |
| 808.0 | -0.002 | 0.003 |
| 807.0 | -0.002 | 0.003 |
| 806.0 | -0.002 | 0.003 |
| 805.0 | -0.002 | 0.002 |
| 804.0 | -0.002 | 0.002 |
| 803.0 | -0.002 | 0.002 |
| 802.0 | -0.002 | 0.002 |
| 801.0 | -0.002 | 0.002 |
| 800.0 | -0.002 | 0.002 |
| 799.0 | -0.002 | 0.001 |
| 798.0 | -0.002 | 0.001 |
| 797.0 | -0.002 | 0.001 |
| 796.0 | -0.002 | 0.001 |
| 795.0 | -0.002 | 0.001 |
| 794.0 | -0.003 | 0.001 |
| 793.0 | -0.003 | 0.001 |
| 792.0 | -0.003 | 0.001 |
| 791.0 | -0.002 | 0.001 |
| 790.0 | -0.002 | 0.001 |
| 789.0 | -0.002 | 0.001 |
| 788.0 | -0.002 | 0.001 |
| 787.0 | -0.002 | 0.001 |
| 786.0 | -0.002 | 0.001 |
| 785.0 | -0.002 | 0.001 |
| 784.0 | -0.002 | 0.001 |
| 783.0 | -0.002 | 0.001 |
| 782.0 | -0.002 | 0.001 |
| 781.0 | -0.002 | 0.001 |
| 780.0 | -0.002 | 0.001 |
| 779.0 | -0.001 | 0.002 |
| 778.0 | 0 | 0.003 |
| 777.0 | 0.001 | 0.004 |
| 776.0 | 0.002 | 0.006 |
| 775.0 | 0.004 | 0.008 |
| 774.0 | 0.005 | 0.009 |
| 773.0 | 0.006 | 0.011 |
| 772.0 | 0.007 | 0.012 |
| 771.0 | 0.007 | 0.013 |
| 770.0 | 0.007 | 0.012 |
| 769.0 | 0.007 | 0.012 |
| 768.0 | 0.006 | 0.01 |
| 767.0 | 0.005 | 0.009 |
| 766.0 | 0.004 | 0.008 |
| 765.0 | 0.003 | 0.006 |
| 764.0 | 0.002 | 0.005 |
| 763.0 | 0.002 | 0.004 |
| 762.0 | 0.001 | 0.003 |
| 761.0 | 0.001 | 0.003 |
| 760.0 | 0 | 0.003 |
| 759.0 | 0 | 0.002 |
| 758.0 | 0 | 0.002 |
| 757.0 | 0 | 0.002 |
| 756.0 | 0 | 0.002 |
| 755.0 | 0 | 0.002 |
| 754.0 | 0 | 0.002 |
| 753.0 | -0.001 | 0.002 |
| 752.0 | -0.001 | 0.002 |
| 751.0 | -0.001 | 0.002 |
| 750.0 | -0.001 | 0.002 |
| 749.0 | 0 | 0.002 |
| 748.0 | -0.001 | 0.002 |
| 747.0 | -0.001 | 0.002 |
| 746.0 | -0.001 | 0.002 |
| 745.0 | -0.001 | 0.002 |
| 744.0 | -0.001 | 0.002 |
| 743.0 | -0.001 | 0.002 |
| 742.0 | -0.001 | 0.002 |
| 741.0 | -0.001 | 0.001 |
| 740.0 | -0.001 | 0.001 |
| 739.0 | -0.001 | 0.001 |
| 738.0 | -0.002 | 0.001 |
| 737.0 | -0.002 | 0.001 |
| 736.0 | -0.002 | 0.001 |
| 735.0 | -0.002 | 0.001 |
| 734.0 | -0.003 | 0.001 |
| 733.0 | -0.003 | 0.001 |
| 732.0 | -0.002 | 0.001 |
| 731.0 | -0.002 | 0.002 |
| 730.0 | -0.002 | 0.002 |
| 729.0 | -0.002 | 0.003 |
| 728.0 | -0.001 | 0.004 |
| 727.0 | 0 | 0.004 |
| 726.0 | 0 | 0.005 |
| 725.0 | 0.001 | 0.005 |
| 724.0 | 0.002 | 0.006 |
| 723.0 | 0.002 | 0.007 |
| 722.0 | 0.002 | 0.007 |
| 721.0 | 0.003 | 0.008 |
| 720.0 | 0.003 | 0.008 |
| 719.0 | 0.004 | 0.008 |
| 718.0 | 0.004 | 0.008 |
| 717.0 | 0.004 | 0.008 |
| 716.0 | 0.004 | 0.008 |
| 715.0 | 0.004 | 0.008 |
| 714.0 | 0.004 | 0.008 |
| 713.0 | 0.005 | 0.007 |
| 712.0 | 0.005 | 0.007 |
| 711.0 | 0.005 | 0.007 |
| 710.0 | 0.005 | 0.007 |
| 709.0 | 0.005 | 0.007 |
| 708.0 | 0.005 | 0.008 |
| 707.0 | 0.005 | 0.008 |
| 706.0 | 0.006 | 0.008 |
| 705.0 | 0.006 | 0.008 |
| 704.0 | 0.006 | 0.008 |
| 703.0 | 0.006 | 0.009 |
| 702.0 | 0.006 | 0.009 |
| 701.0 | 0.006 | 0.009 |
| 700.0 | 0.006 | 0.01 |
| 699.0 | 0.006 | 0.01 |
| 698.0 | 0.006 | 0.01 |
| 697.0 | 0.006 | 0.009 |
| 696.0 | 0.005 | 0.009 |
| 695.0 | 0.004 | 0.008 |
| 694.0 | 0.004 | 0.007 |
| 693.0 | 0.003 | 0.006 |
| 692.0 | 0.002 | 0.005 |
| 691.0 | 0.002 | 0.005 |
| 690.0 | 0.001 | 0.004 |
| 689.0 | 0.001 | 0.003 |
| 688.0 | 0.001 | 0.003 |
| 687.0 | 0.001 | 0.003 |
| 686.0 | 0 | 0.002 |
| 685.0 | 0 | 0.002 |
| 684.0 | 0 | 0.002 |
| 683.0 | -0.001 | 0.001 |
| 682.0 | -0.001 | 0.001 |
| 681.0 | -0.001 | 0.001 |
| 680.0 | -0.001 | 0.002 |
| 679.0 | -0.001 | 0.002 |
| 678.0 | 0 | 0.002 |
| 677.0 | 0 | 0.002 |
| 676.0 | 0 | 0.003 |
| 675.0 | 0 | 0.003 |
| 674.0 | 0.001 | 0.004 |
| 673.0 | 0.001 | 0.005 |
| 672.0 | 0.001 | 0.005 |
| 671.0 | 0.001 | 0.006 |
| 670.0 | 0.001 | 0.006 |
| 669.0 | 0.001 | 0.006 |
| 668.0 | 0.003 | 0.007 |
| 667.0 | 0.003 | 0.007 |
| 666.0 | 0.003 | 0.007 |
| 665.0 | 0.003 | 0.007 |
| 664.0 | 0.002 | 0.007 |
| 663.0 | 0.002 | 0.007 |
| 662.0 | 0.002 | 0.008 |
| 661.0 | 0.003 | 0.008 |
| 660.0 | 0.003 | 0.007 |
| 659.0 | 0.003 | 0.007 |
| 658.0 | 0.002 | 0.006 |
| 657.0 | 0.002 | 0.005 |
| 656.0 | 0.002 | 0.005 |
| 655.0 | 0.001 | 0.004 |
| 654.0 | 0 | 0.004 |
| 653.0 | 0 | 0.003 |
| 652.0 | -0.001 | 0.003 |
| 651.0 | -0.001 | 0.002 |
| 650.0 | -0.002 | 0.001 |